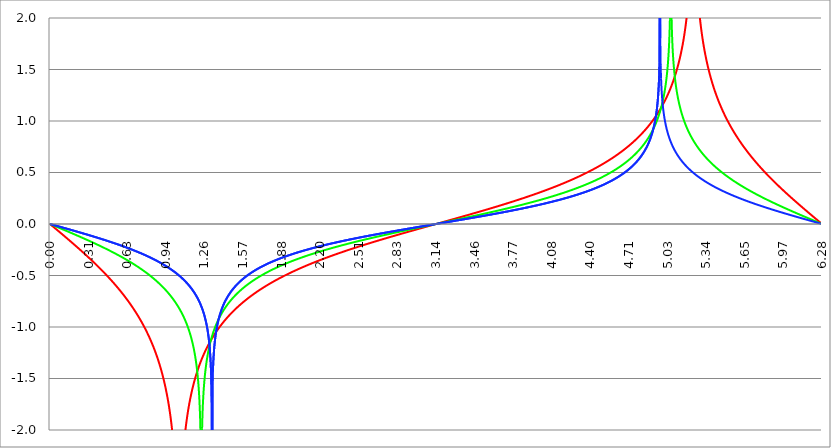
| Category | Series 1 | Series 0 | Series 2 |
|---|---|---|---|
| 0.0 | 0 | 0 | 0 |
| 0.00314159265358979 | -0.003 | -0.002 | -0.001 |
| 0.00628318530717958 | -0.006 | -0.003 | -0.002 |
| 0.00942477796076938 | -0.009 | -0.005 | -0.003 |
| 0.0125663706143592 | -0.013 | -0.006 | -0.004 |
| 0.015707963267949 | -0.016 | -0.008 | -0.005 |
| 0.0188495559215388 | -0.019 | -0.009 | -0.006 |
| 0.0219911485751285 | -0.022 | -0.011 | -0.007 |
| 0.0251327412287183 | -0.025 | -0.013 | -0.008 |
| 0.0282743338823081 | -0.028 | -0.014 | -0.009 |
| 0.0314159265358979 | -0.031 | -0.016 | -0.01 |
| 0.0345575191894877 | -0.035 | -0.017 | -0.012 |
| 0.0376991118430775 | -0.038 | -0.019 | -0.013 |
| 0.0408407044966673 | -0.041 | -0.02 | -0.014 |
| 0.0439822971502571 | -0.044 | -0.022 | -0.015 |
| 0.0471238898038469 | -0.047 | -0.024 | -0.016 |
| 0.0502654824574367 | -0.05 | -0.025 | -0.017 |
| 0.0534070751110265 | -0.053 | -0.027 | -0.018 |
| 0.0565486677646163 | -0.057 | -0.028 | -0.019 |
| 0.059690260418206 | -0.06 | -0.03 | -0.02 |
| 0.0628318530717958 | -0.063 | -0.031 | -0.021 |
| 0.0659734457253856 | -0.066 | -0.033 | -0.022 |
| 0.0691150383789754 | -0.069 | -0.035 | -0.023 |
| 0.0722566310325652 | -0.072 | -0.036 | -0.024 |
| 0.075398223686155 | -0.076 | -0.038 | -0.025 |
| 0.0785398163397448 | -0.079 | -0.039 | -0.026 |
| 0.0816814089933346 | -0.082 | -0.041 | -0.027 |
| 0.0848230016469244 | -0.085 | -0.042 | -0.028 |
| 0.0879645943005142 | -0.088 | -0.044 | -0.029 |
| 0.091106186954104 | -0.091 | -0.046 | -0.03 |
| 0.0942477796076937 | -0.095 | -0.047 | -0.031 |
| 0.0973893722612835 | -0.098 | -0.049 | -0.033 |
| 0.100530964914873 | -0.101 | -0.05 | -0.034 |
| 0.103672557568463 | -0.104 | -0.052 | -0.035 |
| 0.106814150222053 | -0.107 | -0.054 | -0.036 |
| 0.109955742875643 | -0.11 | -0.055 | -0.037 |
| 0.113097335529233 | -0.114 | -0.057 | -0.038 |
| 0.116238928182822 | -0.117 | -0.058 | -0.039 |
| 0.119380520836412 | -0.12 | -0.06 | -0.04 |
| 0.122522113490002 | -0.123 | -0.061 | -0.041 |
| 0.125663706143592 | -0.126 | -0.063 | -0.042 |
| 0.128805298797181 | -0.13 | -0.065 | -0.043 |
| 0.131946891450771 | -0.133 | -0.066 | -0.044 |
| 0.135088484104361 | -0.136 | -0.068 | -0.045 |
| 0.138230076757951 | -0.139 | -0.069 | -0.046 |
| 0.141371669411541 | -0.142 | -0.071 | -0.047 |
| 0.14451326206513 | -0.146 | -0.073 | -0.048 |
| 0.14765485471872 | -0.149 | -0.074 | -0.049 |
| 0.15079644737231 | -0.152 | -0.076 | -0.051 |
| 0.1539380400259 | -0.155 | -0.077 | -0.052 |
| 0.15707963267949 | -0.158 | -0.079 | -0.053 |
| 0.160221225333079 | -0.162 | -0.081 | -0.054 |
| 0.163362817986669 | -0.165 | -0.082 | -0.055 |
| 0.166504410640259 | -0.168 | -0.084 | -0.056 |
| 0.169646003293849 | -0.171 | -0.085 | -0.057 |
| 0.172787595947439 | -0.175 | -0.087 | -0.058 |
| 0.175929188601028 | -0.178 | -0.089 | -0.059 |
| 0.179070781254618 | -0.181 | -0.09 | -0.06 |
| 0.182212373908208 | -0.184 | -0.092 | -0.061 |
| 0.185353966561798 | -0.188 | -0.093 | -0.062 |
| 0.188495559215388 | -0.191 | -0.095 | -0.063 |
| 0.191637151868977 | -0.194 | -0.097 | -0.064 |
| 0.194778744522567 | -0.197 | -0.098 | -0.065 |
| 0.197920337176157 | -0.201 | -0.1 | -0.067 |
| 0.201061929829747 | -0.204 | -0.102 | -0.068 |
| 0.204203522483336 | -0.207 | -0.103 | -0.069 |
| 0.207345115136926 | -0.21 | -0.105 | -0.07 |
| 0.210486707790516 | -0.214 | -0.106 | -0.071 |
| 0.213628300444106 | -0.217 | -0.108 | -0.072 |
| 0.216769893097696 | -0.22 | -0.11 | -0.073 |
| 0.219911485751285 | -0.224 | -0.111 | -0.074 |
| 0.223053078404875 | -0.227 | -0.113 | -0.075 |
| 0.226194671058465 | -0.23 | -0.115 | -0.076 |
| 0.229336263712055 | -0.233 | -0.116 | -0.077 |
| 0.232477856365645 | -0.237 | -0.118 | -0.078 |
| 0.235619449019234 | -0.24 | -0.119 | -0.08 |
| 0.238761041672824 | -0.243 | -0.121 | -0.081 |
| 0.241902634326414 | -0.247 | -0.123 | -0.082 |
| 0.245044226980004 | -0.25 | -0.124 | -0.083 |
| 0.248185819633594 | -0.253 | -0.126 | -0.084 |
| 0.251327412287183 | -0.257 | -0.128 | -0.085 |
| 0.254469004940773 | -0.26 | -0.129 | -0.086 |
| 0.257610597594363 | -0.264 | -0.131 | -0.087 |
| 0.260752190247953 | -0.267 | -0.133 | -0.088 |
| 0.263893782901543 | -0.27 | -0.134 | -0.089 |
| 0.267035375555132 | -0.274 | -0.136 | -0.09 |
| 0.270176968208722 | -0.277 | -0.138 | -0.092 |
| 0.273318560862312 | -0.28 | -0.139 | -0.093 |
| 0.276460153515902 | -0.284 | -0.141 | -0.094 |
| 0.279601746169492 | -0.287 | -0.143 | -0.095 |
| 0.282743338823082 | -0.291 | -0.144 | -0.096 |
| 0.285884931476671 | -0.294 | -0.146 | -0.097 |
| 0.289026524130261 | -0.297 | -0.148 | -0.098 |
| 0.292168116783851 | -0.301 | -0.149 | -0.099 |
| 0.295309709437441 | -0.304 | -0.151 | -0.1 |
| 0.298451302091031 | -0.308 | -0.153 | -0.102 |
| 0.30159289474462 | -0.311 | -0.154 | -0.103 |
| 0.30473448739821 | -0.315 | -0.156 | -0.104 |
| 0.3078760800518 | -0.318 | -0.158 | -0.105 |
| 0.31101767270539 | -0.322 | -0.159 | -0.106 |
| 0.31415926535898 | -0.325 | -0.161 | -0.107 |
| 0.31730085801257 | -0.329 | -0.163 | -0.108 |
| 0.320442450666159 | -0.332 | -0.165 | -0.109 |
| 0.323584043319749 | -0.336 | -0.166 | -0.11 |
| 0.326725635973339 | -0.339 | -0.168 | -0.112 |
| 0.329867228626929 | -0.343 | -0.17 | -0.113 |
| 0.333008821280519 | -0.346 | -0.171 | -0.114 |
| 0.336150413934108 | -0.35 | -0.173 | -0.115 |
| 0.339292006587698 | -0.353 | -0.175 | -0.116 |
| 0.342433599241288 | -0.357 | -0.176 | -0.117 |
| 0.345575191894878 | -0.36 | -0.178 | -0.118 |
| 0.348716784548468 | -0.364 | -0.18 | -0.12 |
| 0.351858377202058 | -0.367 | -0.182 | -0.121 |
| 0.354999969855647 | -0.371 | -0.183 | -0.122 |
| 0.358141562509237 | -0.375 | -0.185 | -0.123 |
| 0.361283155162827 | -0.378 | -0.187 | -0.124 |
| 0.364424747816417 | -0.382 | -0.189 | -0.125 |
| 0.367566340470007 | -0.385 | -0.19 | -0.126 |
| 0.370707933123597 | -0.389 | -0.192 | -0.128 |
| 0.373849525777186 | -0.393 | -0.194 | -0.129 |
| 0.376991118430776 | -0.396 | -0.196 | -0.13 |
| 0.380132711084366 | -0.4 | -0.197 | -0.131 |
| 0.383274303737956 | -0.404 | -0.199 | -0.132 |
| 0.386415896391546 | -0.407 | -0.201 | -0.133 |
| 0.389557489045135 | -0.411 | -0.203 | -0.134 |
| 0.392699081698725 | -0.415 | -0.204 | -0.136 |
| 0.395840674352315 | -0.419 | -0.206 | -0.137 |
| 0.398982267005905 | -0.422 | -0.208 | -0.138 |
| 0.402123859659495 | -0.426 | -0.21 | -0.139 |
| 0.405265452313085 | -0.43 | -0.212 | -0.14 |
| 0.408407044966674 | -0.433 | -0.213 | -0.141 |
| 0.411548637620264 | -0.437 | -0.215 | -0.143 |
| 0.414690230273854 | -0.441 | -0.217 | -0.144 |
| 0.417831822927444 | -0.445 | -0.219 | -0.145 |
| 0.420973415581034 | -0.449 | -0.221 | -0.146 |
| 0.424115008234623 | -0.452 | -0.222 | -0.147 |
| 0.427256600888213 | -0.456 | -0.224 | -0.149 |
| 0.430398193541803 | -0.46 | -0.226 | -0.15 |
| 0.433539786195393 | -0.464 | -0.228 | -0.151 |
| 0.436681378848983 | -0.468 | -0.23 | -0.152 |
| 0.439822971502573 | -0.472 | -0.231 | -0.153 |
| 0.442964564156162 | -0.476 | -0.233 | -0.155 |
| 0.446106156809752 | -0.479 | -0.235 | -0.156 |
| 0.449247749463342 | -0.483 | -0.237 | -0.157 |
| 0.452389342116932 | -0.487 | -0.239 | -0.158 |
| 0.455530934770522 | -0.491 | -0.241 | -0.159 |
| 0.458672527424111 | -0.495 | -0.243 | -0.161 |
| 0.461814120077701 | -0.499 | -0.244 | -0.162 |
| 0.464955712731291 | -0.503 | -0.246 | -0.163 |
| 0.468097305384881 | -0.507 | -0.248 | -0.164 |
| 0.471238898038471 | -0.511 | -0.25 | -0.165 |
| 0.474380490692061 | -0.515 | -0.252 | -0.167 |
| 0.47752208334565 | -0.519 | -0.254 | -0.168 |
| 0.48066367599924 | -0.523 | -0.256 | -0.169 |
| 0.48380526865283 | -0.527 | -0.258 | -0.17 |
| 0.48694686130642 | -0.531 | -0.259 | -0.172 |
| 0.49008845396001 | -0.535 | -0.261 | -0.173 |
| 0.493230046613599 | -0.54 | -0.263 | -0.174 |
| 0.496371639267189 | -0.544 | -0.265 | -0.175 |
| 0.499513231920779 | -0.548 | -0.267 | -0.177 |
| 0.502654824574369 | -0.552 | -0.269 | -0.178 |
| 0.505796417227959 | -0.556 | -0.271 | -0.179 |
| 0.508938009881549 | -0.56 | -0.273 | -0.18 |
| 0.512079602535138 | -0.565 | -0.275 | -0.182 |
| 0.515221195188728 | -0.569 | -0.277 | -0.183 |
| 0.518362787842318 | -0.573 | -0.279 | -0.184 |
| 0.521504380495908 | -0.577 | -0.281 | -0.185 |
| 0.524645973149498 | -0.582 | -0.283 | -0.187 |
| 0.527787565803087 | -0.586 | -0.285 | -0.188 |
| 0.530929158456677 | -0.59 | -0.287 | -0.189 |
| 0.534070751110267 | -0.595 | -0.289 | -0.191 |
| 0.537212343763857 | -0.599 | -0.291 | -0.192 |
| 0.540353936417447 | -0.603 | -0.293 | -0.193 |
| 0.543495529071037 | -0.608 | -0.295 | -0.194 |
| 0.546637121724626 | -0.612 | -0.297 | -0.196 |
| 0.549778714378216 | -0.617 | -0.299 | -0.197 |
| 0.552920307031806 | -0.621 | -0.301 | -0.198 |
| 0.556061899685396 | -0.626 | -0.303 | -0.2 |
| 0.559203492338986 | -0.63 | -0.305 | -0.201 |
| 0.562345084992576 | -0.635 | -0.307 | -0.202 |
| 0.565486677646165 | -0.639 | -0.309 | -0.204 |
| 0.568628270299755 | -0.644 | -0.311 | -0.205 |
| 0.571769862953345 | -0.648 | -0.313 | -0.206 |
| 0.574911455606935 | -0.653 | -0.315 | -0.208 |
| 0.578053048260525 | -0.658 | -0.317 | -0.209 |
| 0.581194640914114 | -0.662 | -0.319 | -0.21 |
| 0.584336233567704 | -0.667 | -0.321 | -0.212 |
| 0.587477826221294 | -0.672 | -0.323 | -0.213 |
| 0.590619418874884 | -0.676 | -0.325 | -0.214 |
| 0.593761011528474 | -0.681 | -0.327 | -0.216 |
| 0.596902604182064 | -0.686 | -0.33 | -0.217 |
| 0.600044196835653 | -0.691 | -0.332 | -0.218 |
| 0.603185789489243 | -0.696 | -0.334 | -0.22 |
| 0.606327382142833 | -0.701 | -0.336 | -0.221 |
| 0.609468974796423 | -0.705 | -0.338 | -0.223 |
| 0.612610567450013 | -0.71 | -0.34 | -0.224 |
| 0.615752160103602 | -0.715 | -0.342 | -0.225 |
| 0.618893752757192 | -0.72 | -0.345 | -0.227 |
| 0.622035345410782 | -0.725 | -0.347 | -0.228 |
| 0.625176938064372 | -0.73 | -0.349 | -0.229 |
| 0.628318530717962 | -0.735 | -0.351 | -0.231 |
| 0.631460123371551 | -0.741 | -0.353 | -0.232 |
| 0.634601716025141 | -0.746 | -0.356 | -0.234 |
| 0.637743308678731 | -0.751 | -0.358 | -0.235 |
| 0.640884901332321 | -0.756 | -0.36 | -0.237 |
| 0.644026493985911 | -0.761 | -0.362 | -0.238 |
| 0.647168086639501 | -0.766 | -0.365 | -0.239 |
| 0.65030967929309 | -0.772 | -0.367 | -0.241 |
| 0.65345127194668 | -0.777 | -0.369 | -0.242 |
| 0.65659286460027 | -0.782 | -0.371 | -0.244 |
| 0.65973445725386 | -0.788 | -0.374 | -0.245 |
| 0.66287604990745 | -0.793 | -0.376 | -0.247 |
| 0.666017642561039 | -0.799 | -0.378 | -0.248 |
| 0.669159235214629 | -0.804 | -0.381 | -0.25 |
| 0.672300827868219 | -0.81 | -0.383 | -0.251 |
| 0.675442420521809 | -0.815 | -0.385 | -0.252 |
| 0.678584013175399 | -0.821 | -0.388 | -0.254 |
| 0.681725605828989 | -0.827 | -0.39 | -0.255 |
| 0.684867198482578 | -0.832 | -0.392 | -0.257 |
| 0.688008791136168 | -0.838 | -0.395 | -0.258 |
| 0.691150383789758 | -0.844 | -0.397 | -0.26 |
| 0.694291976443348 | -0.85 | -0.399 | -0.261 |
| 0.697433569096938 | -0.856 | -0.402 | -0.263 |
| 0.700575161750528 | -0.862 | -0.404 | -0.265 |
| 0.703716754404117 | -0.867 | -0.407 | -0.266 |
| 0.706858347057707 | -0.873 | -0.409 | -0.268 |
| 0.709999939711297 | -0.88 | -0.412 | -0.269 |
| 0.713141532364887 | -0.886 | -0.414 | -0.271 |
| 0.716283125018477 | -0.892 | -0.417 | -0.272 |
| 0.719424717672066 | -0.898 | -0.419 | -0.274 |
| 0.722566310325656 | -0.904 | -0.422 | -0.275 |
| 0.725707902979246 | -0.911 | -0.424 | -0.277 |
| 0.728849495632836 | -0.917 | -0.427 | -0.278 |
| 0.731991088286426 | -0.923 | -0.429 | -0.28 |
| 0.735132680940016 | -0.93 | -0.432 | -0.282 |
| 0.738274273593605 | -0.936 | -0.434 | -0.283 |
| 0.741415866247195 | -0.943 | -0.437 | -0.285 |
| 0.744557458900785 | -0.95 | -0.44 | -0.287 |
| 0.747699051554375 | -0.956 | -0.442 | -0.288 |
| 0.750840644207965 | -0.963 | -0.445 | -0.29 |
| 0.753982236861554 | -0.97 | -0.447 | -0.291 |
| 0.757123829515144 | -0.977 | -0.45 | -0.293 |
| 0.760265422168734 | -0.984 | -0.453 | -0.295 |
| 0.763407014822324 | -0.991 | -0.455 | -0.296 |
| 0.766548607475914 | -0.998 | -0.458 | -0.298 |
| 0.769690200129504 | -1.005 | -0.461 | -0.3 |
| 0.772831792783093 | -1.012 | -0.464 | -0.301 |
| 0.775973385436683 | -1.02 | -0.466 | -0.303 |
| 0.779114978090273 | -1.027 | -0.469 | -0.305 |
| 0.782256570743863 | -1.034 | -0.472 | -0.306 |
| 0.785398163397453 | -1.042 | -0.475 | -0.308 |
| 0.788539756051042 | -1.05 | -0.477 | -0.31 |
| 0.791681348704632 | -1.057 | -0.48 | -0.312 |
| 0.794822941358222 | -1.065 | -0.483 | -0.313 |
| 0.797964534011812 | -1.073 | -0.486 | -0.315 |
| 0.801106126665402 | -1.081 | -0.489 | -0.317 |
| 0.804247719318992 | -1.089 | -0.492 | -0.319 |
| 0.807389311972581 | -1.097 | -0.495 | -0.32 |
| 0.810530904626171 | -1.105 | -0.498 | -0.322 |
| 0.813672497279761 | -1.114 | -0.501 | -0.324 |
| 0.816814089933351 | -1.122 | -0.504 | -0.326 |
| 0.819955682586941 | -1.131 | -0.507 | -0.328 |
| 0.823097275240531 | -1.139 | -0.51 | -0.329 |
| 0.82623886789412 | -1.148 | -0.513 | -0.331 |
| 0.82938046054771 | -1.157 | -0.516 | -0.333 |
| 0.8325220532013 | -1.166 | -0.519 | -0.335 |
| 0.83566364585489 | -1.175 | -0.522 | -0.337 |
| 0.83880523850848 | -1.185 | -0.525 | -0.339 |
| 0.841946831162069 | -1.194 | -0.528 | -0.341 |
| 0.845088423815659 | -1.203 | -0.531 | -0.342 |
| 0.848230016469249 | -1.213 | -0.534 | -0.344 |
| 0.851371609122839 | -1.223 | -0.538 | -0.346 |
| 0.854513201776429 | -1.233 | -0.541 | -0.348 |
| 0.857654794430019 | -1.243 | -0.544 | -0.35 |
| 0.860796387083608 | -1.253 | -0.547 | -0.352 |
| 0.863937979737198 | -1.264 | -0.551 | -0.354 |
| 0.867079572390788 | -1.274 | -0.554 | -0.356 |
| 0.870221165044378 | -1.285 | -0.557 | -0.358 |
| 0.873362757697968 | -1.296 | -0.561 | -0.36 |
| 0.876504350351557 | -1.307 | -0.564 | -0.362 |
| 0.879645943005147 | -1.319 | -0.568 | -0.364 |
| 0.882787535658737 | -1.33 | -0.571 | -0.366 |
| 0.885929128312327 | -1.342 | -0.574 | -0.368 |
| 0.889070720965917 | -1.354 | -0.578 | -0.37 |
| 0.892212313619507 | -1.366 | -0.582 | -0.372 |
| 0.895353906273096 | -1.378 | -0.585 | -0.374 |
| 0.898495498926686 | -1.391 | -0.589 | -0.376 |
| 0.901637091580276 | -1.404 | -0.592 | -0.379 |
| 0.904778684233866 | -1.417 | -0.596 | -0.381 |
| 0.907920276887456 | -1.431 | -0.6 | -0.383 |
| 0.911061869541045 | -1.444 | -0.603 | -0.385 |
| 0.914203462194635 | -1.458 | -0.607 | -0.387 |
| 0.917345054848225 | -1.473 | -0.611 | -0.389 |
| 0.920486647501815 | -1.488 | -0.615 | -0.392 |
| 0.923628240155405 | -1.503 | -0.619 | -0.394 |
| 0.926769832808995 | -1.518 | -0.623 | -0.396 |
| 0.929911425462584 | -1.534 | -0.627 | -0.398 |
| 0.933053018116174 | -1.55 | -0.63 | -0.4 |
| 0.936194610769764 | -1.567 | -0.635 | -0.403 |
| 0.939336203423354 | -1.584 | -0.639 | -0.405 |
| 0.942477796076944 | -1.602 | -0.643 | -0.407 |
| 0.945619388730533 | -1.62 | -0.647 | -0.41 |
| 0.948760981384123 | -1.639 | -0.651 | -0.412 |
| 0.951902574037713 | -1.658 | -0.655 | -0.414 |
| 0.955044166691303 | -1.678 | -0.659 | -0.417 |
| 0.958185759344893 | -1.698 | -0.664 | -0.419 |
| 0.961327351998483 | -1.72 | -0.668 | -0.422 |
| 0.964468944652072 | -1.742 | -0.673 | -0.424 |
| 0.967610537305662 | -1.765 | -0.677 | -0.427 |
| 0.970752129959252 | -1.788 | -0.681 | -0.429 |
| 0.973893722612842 | -1.813 | -0.686 | -0.432 |
| 0.977035315266432 | -1.839 | -0.691 | -0.434 |
| 0.980176907920022 | -1.866 | -0.695 | -0.437 |
| 0.983318500573611 | -1.894 | -0.7 | -0.439 |
| 0.986460093227201 | -1.924 | -0.705 | -0.442 |
| 0.989601685880791 | -1.955 | -0.71 | -0.444 |
| 0.992743278534381 | -1.988 | -0.714 | -0.447 |
| 0.995884871187971 | -2.023 | -0.719 | -0.45 |
| 0.99902646384156 | -2.06 | -0.724 | -0.452 |
| 1.00216805649515 | -2.1 | -0.73 | -0.455 |
| 1.00530964914874 | -2.142 | -0.735 | -0.458 |
| 1.00845124180233 | -2.187 | -0.74 | -0.461 |
| 1.01159283445592 | -2.237 | -0.745 | -0.463 |
| 1.01473442710951 | -2.291 | -0.75 | -0.466 |
| 1.017876019763099 | -2.35 | -0.756 | -0.469 |
| 1.021017612416689 | -2.416 | -0.761 | -0.472 |
| 1.02415920507028 | -2.49 | -0.767 | -0.475 |
| 1.027300797723869 | -2.575 | -0.773 | -0.478 |
| 1.030442390377459 | -2.675 | -0.778 | -0.481 |
| 1.033583983031048 | -2.796 | -0.784 | -0.484 |
| 1.036725575684638 | -2.948 | -0.79 | -0.487 |
| 1.039867168338228 | -3.154 | -0.796 | -0.49 |
| 1.043008760991818 | -3.478 | -0.802 | -0.493 |
| 1.046150353645408 | -4.279 | -0.808 | -0.496 |
| 1.049291946298998 | -3.879 | -0.815 | -0.499 |
| 1.052433538952587 | -3.35 | -0.821 | -0.502 |
| 1.055575131606177 | -3.08 | -0.828 | -0.505 |
| 1.058716724259767 | -2.896 | -0.834 | -0.509 |
| 1.061858316913357 | -2.757 | -0.841 | -0.512 |
| 1.064999909566947 | -2.646 | -0.848 | -0.515 |
| 1.068141502220536 | -2.553 | -0.855 | -0.519 |
| 1.071283094874126 | -2.472 | -0.862 | -0.522 |
| 1.074424687527716 | -2.402 | -0.869 | -0.526 |
| 1.077566280181306 | -2.34 | -0.877 | -0.529 |
| 1.080707872834896 | -2.283 | -0.884 | -0.533 |
| 1.083849465488486 | -2.232 | -0.892 | -0.536 |
| 1.086991058142075 | -2.185 | -0.9 | -0.54 |
| 1.090132650795665 | -2.142 | -0.908 | -0.544 |
| 1.093274243449255 | -2.101 | -0.916 | -0.547 |
| 1.096415836102845 | -2.064 | -0.924 | -0.551 |
| 1.099557428756435 | -2.029 | -0.933 | -0.555 |
| 1.102699021410025 | -1.995 | -0.942 | -0.559 |
| 1.105840614063614 | -1.964 | -0.951 | -0.563 |
| 1.108982206717204 | -1.935 | -0.96 | -0.567 |
| 1.112123799370794 | -1.906 | -0.969 | -0.571 |
| 1.115265392024384 | -1.88 | -0.979 | -0.575 |
| 1.118406984677974 | -1.854 | -0.989 | -0.579 |
| 1.121548577331563 | -1.83 | -0.999 | -0.583 |
| 1.124690169985153 | -1.806 | -1.01 | -0.587 |
| 1.127831762638743 | -1.784 | -1.021 | -0.592 |
| 1.130973355292333 | -1.762 | -1.032 | -0.596 |
| 1.134114947945923 | -1.741 | -1.043 | -0.601 |
| 1.137256540599513 | -1.721 | -1.055 | -0.605 |
| 1.140398133253102 | -1.702 | -1.067 | -0.61 |
| 1.143539725906692 | -1.683 | -1.08 | -0.615 |
| 1.146681318560282 | -1.665 | -1.093 | -0.62 |
| 1.149822911213872 | -1.648 | -1.107 | -0.624 |
| 1.152964503867462 | -1.631 | -1.121 | -0.629 |
| 1.156106096521051 | -1.615 | -1.136 | -0.635 |
| 1.159247689174641 | -1.599 | -1.151 | -0.64 |
| 1.162389281828231 | -1.583 | -1.167 | -0.645 |
| 1.165530874481821 | -1.568 | -1.184 | -0.65 |
| 1.168672467135411 | -1.553 | -1.202 | -0.656 |
| 1.171814059789001 | -1.539 | -1.22 | -0.662 |
| 1.17495565244259 | -1.525 | -1.24 | -0.667 |
| 1.17809724509618 | -1.512 | -1.26 | -0.673 |
| 1.18123883774977 | -1.498 | -1.282 | -0.679 |
| 1.18438043040336 | -1.486 | -1.305 | -0.685 |
| 1.18752202305695 | -1.473 | -1.33 | -0.691 |
| 1.190663615710539 | -1.461 | -1.357 | -0.698 |
| 1.193805208364129 | -1.449 | -1.386 | -0.704 |
| 1.19694680101772 | -1.437 | -1.417 | -0.711 |
| 1.200088393671309 | -1.425 | -1.452 | -0.718 |
| 1.203229986324899 | -1.414 | -1.49 | -0.725 |
| 1.206371578978489 | -1.403 | -1.533 | -0.732 |
| 1.209513171632078 | -1.392 | -1.581 | -0.74 |
| 1.212654764285668 | -1.381 | -1.638 | -0.748 |
| 1.215796356939258 | -1.371 | -1.704 | -0.756 |
| 1.218937949592848 | -1.361 | -1.787 | -0.764 |
| 1.222079542246438 | -1.351 | -1.894 | -0.772 |
| 1.225221134900027 | -1.341 | -2.048 | -0.781 |
| 1.228362727553617 | -1.331 | -2.329 | -0.79 |
| 1.231504320207207 | -1.322 | -2.881 | -0.799 |
| 1.234645912860797 | -1.313 | -2.205 | -0.809 |
| 1.237787505514387 | -1.303 | -1.988 | -0.819 |
| 1.240929098167977 | -1.294 | -1.854 | -0.829 |
| 1.244070690821566 | -1.286 | -1.757 | -0.84 |
| 1.247212283475156 | -1.277 | -1.682 | -0.851 |
| 1.250353876128746 | -1.268 | -1.619 | -0.863 |
| 1.253495468782336 | -1.26 | -1.567 | -0.876 |
| 1.256637061435926 | -1.252 | -1.521 | -0.889 |
| 1.259778654089515 | -1.243 | -1.48 | -0.902 |
| 1.262920246743105 | -1.235 | -1.444 | -0.917 |
| 1.266061839396695 | -1.228 | -1.411 | -0.932 |
| 1.269203432050285 | -1.22 | -1.38 | -0.948 |
| 1.272345024703875 | -1.212 | -1.353 | -0.965 |
| 1.275486617357465 | -1.204 | -1.327 | -0.984 |
| 1.278628210011054 | -1.197 | -1.303 | -1.004 |
| 1.281769802664644 | -1.19 | -1.281 | -1.025 |
| 1.284911395318234 | -1.182 | -1.26 | -1.049 |
| 1.288052987971824 | -1.175 | -1.24 | -1.074 |
| 1.291194580625414 | -1.168 | -1.221 | -1.103 |
| 1.294336173279003 | -1.161 | -1.203 | -1.135 |
| 1.297477765932593 | -1.154 | -1.186 | -1.172 |
| 1.300619358586183 | -1.148 | -1.17 | -1.215 |
| 1.303760951239773 | -1.141 | -1.155 | -1.266 |
| 1.306902543893363 | -1.134 | -1.14 | -1.33 |
| 1.310044136546953 | -1.128 | -1.126 | -1.415 |
| 1.313185729200542 | -1.121 | -1.112 | -1.542 |
| 1.316327321854132 | -1.115 | -1.099 | -1.804 |
| 1.319468914507722 | -1.109 | -1.087 | -3 |
| 1.322610507161312 | -1.102 | -1.075 | -1.566 |
| 1.325752099814902 | -1.096 | -1.063 | -1.43 |
| 1.328893692468491 | -1.09 | -1.052 | -1.341 |
| 1.332035285122081 | -1.084 | -1.041 | -1.275 |
| 1.335176877775671 | -1.078 | -1.03 | -1.222 |
| 1.338318470429261 | -1.072 | -1.02 | -1.179 |
| 1.341460063082851 | -1.067 | -1.01 | -1.142 |
| 1.344601655736441 | -1.061 | -1 | -1.109 |
| 1.34774324839003 | -1.055 | -0.99 | -1.08 |
| 1.35088484104362 | -1.05 | -0.981 | -1.054 |
| 1.35402643369721 | -1.044 | -0.972 | -1.031 |
| 1.3571680263508 | -1.039 | -0.963 | -1.009 |
| 1.36030961900439 | -1.033 | -0.955 | -0.989 |
| 1.363451211657979 | -1.028 | -0.947 | -0.971 |
| 1.36659280431157 | -1.022 | -0.938 | -0.954 |
| 1.369734396965159 | -1.017 | -0.93 | -0.938 |
| 1.372875989618749 | -1.012 | -0.923 | -0.922 |
| 1.376017582272339 | -1.007 | -0.915 | -0.908 |
| 1.379159174925929 | -1.002 | -0.908 | -0.895 |
| 1.382300767579518 | -0.997 | -0.901 | -0.882 |
| 1.385442360233108 | -0.992 | -0.893 | -0.869 |
| 1.388583952886698 | -0.987 | -0.886 | -0.858 |
| 1.391725545540288 | -0.982 | -0.88 | -0.847 |
| 1.394867138193878 | -0.977 | -0.873 | -0.836 |
| 1.398008730847468 | -0.972 | -0.866 | -0.826 |
| 1.401150323501057 | -0.967 | -0.86 | -0.816 |
| 1.404291916154647 | -0.963 | -0.854 | -0.806 |
| 1.407433508808237 | -0.958 | -0.847 | -0.797 |
| 1.410575101461827 | -0.953 | -0.841 | -0.788 |
| 1.413716694115417 | -0.949 | -0.835 | -0.78 |
| 1.416858286769006 | -0.944 | -0.83 | -0.771 |
| 1.419999879422596 | -0.94 | -0.824 | -0.763 |
| 1.423141472076186 | -0.935 | -0.818 | -0.756 |
| 1.426283064729776 | -0.931 | -0.813 | -0.748 |
| 1.429424657383366 | -0.926 | -0.807 | -0.741 |
| 1.432566250036956 | -0.922 | -0.802 | -0.734 |
| 1.435707842690545 | -0.918 | -0.796 | -0.727 |
| 1.438849435344135 | -0.913 | -0.791 | -0.72 |
| 1.441991027997725 | -0.909 | -0.786 | -0.714 |
| 1.445132620651315 | -0.905 | -0.781 | -0.707 |
| 1.448274213304905 | -0.901 | -0.776 | -0.701 |
| 1.451415805958494 | -0.897 | -0.771 | -0.695 |
| 1.454557398612084 | -0.893 | -0.766 | -0.689 |
| 1.457698991265674 | -0.889 | -0.761 | -0.683 |
| 1.460840583919264 | -0.885 | -0.757 | -0.678 |
| 1.463982176572854 | -0.88 | -0.752 | -0.672 |
| 1.467123769226444 | -0.877 | -0.747 | -0.667 |
| 1.470265361880033 | -0.873 | -0.743 | -0.661 |
| 1.473406954533623 | -0.869 | -0.738 | -0.656 |
| 1.476548547187213 | -0.865 | -0.734 | -0.651 |
| 1.479690139840803 | -0.861 | -0.73 | -0.646 |
| 1.482831732494393 | -0.857 | -0.725 | -0.641 |
| 1.485973325147982 | -0.853 | -0.721 | -0.636 |
| 1.489114917801572 | -0.85 | -0.717 | -0.632 |
| 1.492256510455162 | -0.846 | -0.713 | -0.627 |
| 1.495398103108752 | -0.842 | -0.709 | -0.623 |
| 1.498539695762342 | -0.838 | -0.705 | -0.618 |
| 1.501681288415932 | -0.835 | -0.701 | -0.614 |
| 1.504822881069521 | -0.831 | -0.697 | -0.609 |
| 1.507964473723111 | -0.827 | -0.693 | -0.605 |
| 1.511106066376701 | -0.824 | -0.689 | -0.601 |
| 1.514247659030291 | -0.82 | -0.685 | -0.597 |
| 1.517389251683881 | -0.817 | -0.681 | -0.593 |
| 1.520530844337471 | -0.813 | -0.678 | -0.589 |
| 1.52367243699106 | -0.81 | -0.674 | -0.585 |
| 1.52681402964465 | -0.806 | -0.67 | -0.581 |
| 1.52995562229824 | -0.803 | -0.667 | -0.577 |
| 1.53309721495183 | -0.8 | -0.663 | -0.574 |
| 1.53623880760542 | -0.796 | -0.66 | -0.57 |
| 1.539380400259009 | -0.793 | -0.656 | -0.566 |
| 1.542521992912599 | -0.789 | -0.653 | -0.563 |
| 1.545663585566189 | -0.786 | -0.649 | -0.559 |
| 1.548805178219779 | -0.783 | -0.646 | -0.556 |
| 1.551946770873369 | -0.78 | -0.643 | -0.552 |
| 1.555088363526959 | -0.776 | -0.639 | -0.549 |
| 1.558229956180548 | -0.773 | -0.636 | -0.546 |
| 1.561371548834138 | -0.77 | -0.633 | -0.542 |
| 1.564513141487728 | -0.767 | -0.63 | -0.539 |
| 1.567654734141318 | -0.763 | -0.626 | -0.536 |
| 1.570796326794908 | -0.76 | -0.623 | -0.533 |
| 1.573937919448497 | -0.757 | -0.62 | -0.53 |
| 1.577079512102087 | -0.754 | -0.617 | -0.527 |
| 1.580221104755677 | -0.751 | -0.614 | -0.524 |
| 1.583362697409267 | -0.748 | -0.611 | -0.521 |
| 1.586504290062857 | -0.745 | -0.608 | -0.518 |
| 1.589645882716447 | -0.742 | -0.605 | -0.515 |
| 1.592787475370036 | -0.739 | -0.602 | -0.512 |
| 1.595929068023626 | -0.736 | -0.599 | -0.509 |
| 1.599070660677216 | -0.733 | -0.596 | -0.506 |
| 1.602212253330806 | -0.73 | -0.593 | -0.503 |
| 1.605353845984396 | -0.727 | -0.59 | -0.5 |
| 1.608495438637985 | -0.724 | -0.588 | -0.498 |
| 1.611637031291575 | -0.721 | -0.585 | -0.495 |
| 1.614778623945165 | -0.718 | -0.582 | -0.492 |
| 1.617920216598755 | -0.715 | -0.579 | -0.49 |
| 1.621061809252345 | -0.712 | -0.576 | -0.487 |
| 1.624203401905935 | -0.71 | -0.574 | -0.484 |
| 1.627344994559524 | -0.707 | -0.571 | -0.482 |
| 1.630486587213114 | -0.704 | -0.568 | -0.479 |
| 1.633628179866704 | -0.701 | -0.566 | -0.477 |
| 1.636769772520294 | -0.698 | -0.563 | -0.474 |
| 1.639911365173884 | -0.696 | -0.56 | -0.472 |
| 1.643052957827473 | -0.693 | -0.558 | -0.469 |
| 1.646194550481063 | -0.69 | -0.555 | -0.467 |
| 1.649336143134653 | -0.687 | -0.553 | -0.464 |
| 1.652477735788243 | -0.685 | -0.55 | -0.462 |
| 1.655619328441833 | -0.682 | -0.548 | -0.46 |
| 1.658760921095423 | -0.679 | -0.545 | -0.457 |
| 1.661902513749012 | -0.677 | -0.543 | -0.455 |
| 1.665044106402602 | -0.674 | -0.54 | -0.453 |
| 1.668185699056192 | -0.671 | -0.538 | -0.451 |
| 1.671327291709782 | -0.669 | -0.535 | -0.448 |
| 1.674468884363372 | -0.666 | -0.533 | -0.446 |
| 1.677610477016961 | -0.664 | -0.531 | -0.444 |
| 1.680752069670551 | -0.661 | -0.528 | -0.442 |
| 1.683893662324141 | -0.658 | -0.526 | -0.439 |
| 1.687035254977731 | -0.656 | -0.523 | -0.437 |
| 1.690176847631321 | -0.653 | -0.521 | -0.435 |
| 1.693318440284911 | -0.651 | -0.519 | -0.433 |
| 1.6964600329385 | -0.648 | -0.517 | -0.431 |
| 1.69960162559209 | -0.646 | -0.514 | -0.429 |
| 1.70274321824568 | -0.643 | -0.512 | -0.427 |
| 1.70588481089927 | -0.641 | -0.51 | -0.425 |
| 1.70902640355286 | -0.638 | -0.508 | -0.423 |
| 1.712167996206449 | -0.636 | -0.505 | -0.421 |
| 1.715309588860039 | -0.633 | -0.503 | -0.419 |
| 1.71845118151363 | -0.631 | -0.501 | -0.417 |
| 1.721592774167219 | -0.629 | -0.499 | -0.415 |
| 1.724734366820809 | -0.626 | -0.497 | -0.413 |
| 1.727875959474399 | -0.624 | -0.494 | -0.411 |
| 1.731017552127988 | -0.621 | -0.492 | -0.409 |
| 1.734159144781578 | -0.619 | -0.49 | -0.407 |
| 1.737300737435168 | -0.617 | -0.488 | -0.405 |
| 1.740442330088758 | -0.614 | -0.486 | -0.403 |
| 1.743583922742348 | -0.612 | -0.484 | -0.401 |
| 1.746725515395937 | -0.61 | -0.482 | -0.4 |
| 1.749867108049527 | -0.607 | -0.48 | -0.398 |
| 1.753008700703117 | -0.605 | -0.478 | -0.396 |
| 1.756150293356707 | -0.603 | -0.476 | -0.394 |
| 1.759291886010297 | -0.6 | -0.474 | -0.392 |
| 1.762433478663887 | -0.598 | -0.472 | -0.39 |
| 1.765575071317476 | -0.596 | -0.47 | -0.389 |
| 1.768716663971066 | -0.594 | -0.468 | -0.387 |
| 1.771858256624656 | -0.591 | -0.466 | -0.385 |
| 1.774999849278246 | -0.589 | -0.464 | -0.383 |
| 1.778141441931836 | -0.587 | -0.462 | -0.382 |
| 1.781283034585426 | -0.585 | -0.46 | -0.38 |
| 1.784424627239015 | -0.582 | -0.458 | -0.378 |
| 1.787566219892605 | -0.58 | -0.456 | -0.377 |
| 1.790707812546195 | -0.578 | -0.454 | -0.375 |
| 1.793849405199785 | -0.576 | -0.452 | -0.373 |
| 1.796990997853375 | -0.574 | -0.45 | -0.372 |
| 1.800132590506964 | -0.571 | -0.449 | -0.37 |
| 1.803274183160554 | -0.569 | -0.447 | -0.368 |
| 1.806415775814144 | -0.567 | -0.445 | -0.367 |
| 1.809557368467734 | -0.565 | -0.443 | -0.365 |
| 1.812698961121324 | -0.563 | -0.441 | -0.363 |
| 1.815840553774914 | -0.561 | -0.439 | -0.362 |
| 1.818982146428503 | -0.559 | -0.438 | -0.36 |
| 1.822123739082093 | -0.557 | -0.436 | -0.359 |
| 1.825265331735683 | -0.554 | -0.434 | -0.357 |
| 1.828406924389273 | -0.552 | -0.432 | -0.355 |
| 1.831548517042863 | -0.55 | -0.43 | -0.354 |
| 1.834690109696452 | -0.548 | -0.429 | -0.352 |
| 1.837831702350042 | -0.546 | -0.427 | -0.351 |
| 1.840973295003632 | -0.544 | -0.425 | -0.349 |
| 1.844114887657222 | -0.542 | -0.423 | -0.348 |
| 1.847256480310812 | -0.54 | -0.422 | -0.346 |
| 1.850398072964402 | -0.538 | -0.42 | -0.345 |
| 1.853539665617991 | -0.536 | -0.418 | -0.343 |
| 1.856681258271581 | -0.534 | -0.416 | -0.342 |
| 1.859822850925171 | -0.532 | -0.415 | -0.34 |
| 1.862964443578761 | -0.53 | -0.413 | -0.339 |
| 1.866106036232351 | -0.528 | -0.411 | -0.337 |
| 1.86924762888594 | -0.526 | -0.41 | -0.336 |
| 1.87238922153953 | -0.524 | -0.408 | -0.335 |
| 1.87553081419312 | -0.522 | -0.406 | -0.333 |
| 1.87867240684671 | -0.52 | -0.405 | -0.332 |
| 1.8818139995003 | -0.518 | -0.403 | -0.33 |
| 1.88495559215389 | -0.516 | -0.401 | -0.329 |
| 1.888097184807479 | -0.514 | -0.4 | -0.327 |
| 1.891238777461069 | -0.512 | -0.398 | -0.326 |
| 1.89438037011466 | -0.51 | -0.397 | -0.325 |
| 1.897521962768249 | -0.508 | -0.395 | -0.323 |
| 1.900663555421839 | -0.507 | -0.393 | -0.322 |
| 1.903805148075429 | -0.505 | -0.392 | -0.321 |
| 1.906946740729018 | -0.503 | -0.39 | -0.319 |
| 1.910088333382608 | -0.501 | -0.389 | -0.318 |
| 1.913229926036198 | -0.499 | -0.387 | -0.317 |
| 1.916371518689788 | -0.497 | -0.386 | -0.315 |
| 1.919513111343378 | -0.495 | -0.384 | -0.314 |
| 1.922654703996967 | -0.493 | -0.382 | -0.313 |
| 1.925796296650557 | -0.492 | -0.381 | -0.311 |
| 1.928937889304147 | -0.49 | -0.379 | -0.31 |
| 1.932079481957737 | -0.488 | -0.378 | -0.309 |
| 1.935221074611327 | -0.486 | -0.376 | -0.307 |
| 1.938362667264917 | -0.484 | -0.375 | -0.306 |
| 1.941504259918506 | -0.482 | -0.373 | -0.305 |
| 1.944645852572096 | -0.481 | -0.372 | -0.303 |
| 1.947787445225686 | -0.479 | -0.37 | -0.302 |
| 1.950929037879276 | -0.477 | -0.369 | -0.301 |
| 1.954070630532866 | -0.475 | -0.367 | -0.3 |
| 1.957212223186455 | -0.473 | -0.366 | -0.298 |
| 1.960353815840045 | -0.472 | -0.364 | -0.297 |
| 1.963495408493635 | -0.47 | -0.363 | -0.296 |
| 1.966637001147225 | -0.468 | -0.361 | -0.295 |
| 1.969778593800815 | -0.466 | -0.36 | -0.293 |
| 1.972920186454405 | -0.464 | -0.359 | -0.292 |
| 1.976061779107994 | -0.463 | -0.357 | -0.291 |
| 1.979203371761584 | -0.461 | -0.356 | -0.29 |
| 1.982344964415174 | -0.459 | -0.354 | -0.289 |
| 1.985486557068764 | -0.457 | -0.353 | -0.287 |
| 1.988628149722354 | -0.456 | -0.351 | -0.286 |
| 1.991769742375943 | -0.454 | -0.35 | -0.285 |
| 1.994911335029533 | -0.452 | -0.349 | -0.284 |
| 1.998052927683123 | -0.451 | -0.347 | -0.283 |
| 2.001194520336712 | -0.449 | -0.346 | -0.281 |
| 2.004336112990302 | -0.447 | -0.344 | -0.28 |
| 2.007477705643892 | -0.445 | -0.343 | -0.279 |
| 2.010619298297482 | -0.444 | -0.342 | -0.278 |
| 2.013760890951071 | -0.442 | -0.34 | -0.277 |
| 2.016902483604661 | -0.44 | -0.339 | -0.276 |
| 2.02004407625825 | -0.439 | -0.338 | -0.274 |
| 2.02318566891184 | -0.437 | -0.336 | -0.273 |
| 2.02632726156543 | -0.435 | -0.335 | -0.272 |
| 2.029468854219019 | -0.434 | -0.333 | -0.271 |
| 2.032610446872609 | -0.432 | -0.332 | -0.27 |
| 2.035752039526198 | -0.43 | -0.331 | -0.269 |
| 2.038893632179788 | -0.429 | -0.329 | -0.268 |
| 2.042035224833378 | -0.427 | -0.328 | -0.267 |
| 2.045176817486967 | -0.425 | -0.327 | -0.265 |
| 2.048318410140557 | -0.424 | -0.325 | -0.264 |
| 2.051460002794146 | -0.422 | -0.324 | -0.263 |
| 2.054601595447736 | -0.42 | -0.323 | -0.262 |
| 2.057743188101325 | -0.419 | -0.321 | -0.261 |
| 2.060884780754915 | -0.417 | -0.32 | -0.26 |
| 2.064026373408505 | -0.416 | -0.319 | -0.259 |
| 2.067167966062094 | -0.414 | -0.318 | -0.258 |
| 2.070309558715684 | -0.412 | -0.316 | -0.257 |
| 2.073451151369273 | -0.411 | -0.315 | -0.256 |
| 2.076592744022863 | -0.409 | -0.314 | -0.254 |
| 2.079734336676452 | -0.408 | -0.312 | -0.253 |
| 2.082875929330042 | -0.406 | -0.311 | -0.252 |
| 2.086017521983632 | -0.404 | -0.31 | -0.251 |
| 2.089159114637221 | -0.403 | -0.309 | -0.25 |
| 2.092300707290811 | -0.401 | -0.307 | -0.249 |
| 2.095442299944401 | -0.4 | -0.306 | -0.248 |
| 2.09858389259799 | -0.398 | -0.305 | -0.247 |
| 2.10172548525158 | -0.397 | -0.304 | -0.246 |
| 2.104867077905169 | -0.395 | -0.302 | -0.245 |
| 2.108008670558759 | -0.393 | -0.301 | -0.244 |
| 2.111150263212349 | -0.392 | -0.3 | -0.243 |
| 2.114291855865938 | -0.39 | -0.299 | -0.242 |
| 2.117433448519528 | -0.389 | -0.297 | -0.241 |
| 2.120575041173117 | -0.387 | -0.296 | -0.24 |
| 2.123716633826707 | -0.386 | -0.295 | -0.239 |
| 2.126858226480297 | -0.384 | -0.294 | -0.238 |
| 2.129999819133886 | -0.383 | -0.293 | -0.237 |
| 2.133141411787476 | -0.381 | -0.291 | -0.236 |
| 2.136283004441065 | -0.38 | -0.29 | -0.235 |
| 2.139424597094655 | -0.378 | -0.289 | -0.234 |
| 2.142566189748245 | -0.377 | -0.288 | -0.233 |
| 2.145707782401834 | -0.375 | -0.287 | -0.232 |
| 2.148849375055424 | -0.374 | -0.285 | -0.231 |
| 2.151990967709013 | -0.372 | -0.284 | -0.23 |
| 2.155132560362603 | -0.371 | -0.283 | -0.229 |
| 2.158274153016193 | -0.369 | -0.282 | -0.228 |
| 2.161415745669782 | -0.368 | -0.281 | -0.227 |
| 2.164557338323372 | -0.366 | -0.279 | -0.226 |
| 2.167698930976961 | -0.365 | -0.278 | -0.225 |
| 2.170840523630551 | -0.363 | -0.277 | -0.224 |
| 2.173982116284141 | -0.362 | -0.276 | -0.223 |
| 2.17712370893773 | -0.36 | -0.275 | -0.222 |
| 2.18026530159132 | -0.359 | -0.274 | -0.221 |
| 2.183406894244909 | -0.357 | -0.272 | -0.22 |
| 2.186548486898499 | -0.356 | -0.271 | -0.219 |
| 2.189690079552089 | -0.354 | -0.27 | -0.218 |
| 2.192831672205678 | -0.353 | -0.269 | -0.217 |
| 2.195973264859268 | -0.351 | -0.268 | -0.216 |
| 2.199114857512857 | -0.35 | -0.267 | -0.216 |
| 2.202256450166447 | -0.349 | -0.266 | -0.215 |
| 2.205398042820036 | -0.347 | -0.264 | -0.214 |
| 2.208539635473626 | -0.346 | -0.263 | -0.213 |
| 2.211681228127216 | -0.344 | -0.262 | -0.212 |
| 2.214822820780805 | -0.343 | -0.261 | -0.211 |
| 2.217964413434395 | -0.341 | -0.26 | -0.21 |
| 2.221106006087984 | -0.34 | -0.259 | -0.209 |
| 2.224247598741574 | -0.339 | -0.258 | -0.208 |
| 2.227389191395164 | -0.337 | -0.257 | -0.207 |
| 2.230530784048753 | -0.336 | -0.256 | -0.206 |
| 2.233672376702343 | -0.334 | -0.254 | -0.205 |
| 2.236813969355933 | -0.333 | -0.253 | -0.204 |
| 2.239955562009522 | -0.332 | -0.252 | -0.204 |
| 2.243097154663112 | -0.33 | -0.251 | -0.203 |
| 2.246238747316701 | -0.329 | -0.25 | -0.202 |
| 2.249380339970291 | -0.327 | -0.249 | -0.201 |
| 2.252521932623881 | -0.326 | -0.248 | -0.2 |
| 2.25566352527747 | -0.325 | -0.247 | -0.199 |
| 2.25880511793106 | -0.323 | -0.246 | -0.198 |
| 2.261946710584649 | -0.322 | -0.245 | -0.197 |
| 2.265088303238239 | -0.32 | -0.244 | -0.196 |
| 2.268229895891829 | -0.319 | -0.242 | -0.196 |
| 2.271371488545418 | -0.318 | -0.241 | -0.195 |
| 2.274513081199008 | -0.316 | -0.24 | -0.194 |
| 2.277654673852597 | -0.315 | -0.239 | -0.193 |
| 2.280796266506186 | -0.314 | -0.238 | -0.192 |
| 2.283937859159776 | -0.312 | -0.237 | -0.191 |
| 2.287079451813366 | -0.311 | -0.236 | -0.19 |
| 2.290221044466955 | -0.309 | -0.235 | -0.189 |
| 2.293362637120545 | -0.308 | -0.234 | -0.189 |
| 2.296504229774135 | -0.307 | -0.233 | -0.188 |
| 2.299645822427724 | -0.305 | -0.232 | -0.187 |
| 2.302787415081314 | -0.304 | -0.231 | -0.186 |
| 2.305929007734904 | -0.303 | -0.23 | -0.185 |
| 2.309070600388493 | -0.301 | -0.229 | -0.184 |
| 2.312212193042083 | -0.3 | -0.228 | -0.183 |
| 2.315353785695672 | -0.299 | -0.227 | -0.183 |
| 2.318495378349262 | -0.297 | -0.226 | -0.182 |
| 2.321636971002852 | -0.296 | -0.225 | -0.181 |
| 2.324778563656441 | -0.295 | -0.224 | -0.18 |
| 2.327920156310031 | -0.293 | -0.223 | -0.179 |
| 2.33106174896362 | -0.292 | -0.221 | -0.178 |
| 2.33420334161721 | -0.291 | -0.22 | -0.178 |
| 2.3373449342708 | -0.289 | -0.219 | -0.177 |
| 2.340486526924389 | -0.288 | -0.218 | -0.176 |
| 2.343628119577979 | -0.287 | -0.217 | -0.175 |
| 2.346769712231568 | -0.286 | -0.216 | -0.174 |
| 2.349911304885158 | -0.284 | -0.215 | -0.173 |
| 2.353052897538748 | -0.283 | -0.214 | -0.173 |
| 2.356194490192337 | -0.282 | -0.213 | -0.172 |
| 2.359336082845927 | -0.28 | -0.212 | -0.171 |
| 2.362477675499516 | -0.279 | -0.211 | -0.17 |
| 2.365619268153106 | -0.278 | -0.21 | -0.169 |
| 2.368760860806696 | -0.276 | -0.209 | -0.168 |
| 2.371902453460285 | -0.275 | -0.208 | -0.168 |
| 2.375044046113875 | -0.274 | -0.207 | -0.167 |
| 2.378185638767464 | -0.273 | -0.206 | -0.166 |
| 2.381327231421054 | -0.271 | -0.205 | -0.165 |
| 2.384468824074644 | -0.27 | -0.204 | -0.164 |
| 2.387610416728233 | -0.269 | -0.203 | -0.164 |
| 2.390752009381823 | -0.267 | -0.202 | -0.163 |
| 2.393893602035412 | -0.266 | -0.201 | -0.162 |
| 2.397035194689002 | -0.265 | -0.2 | -0.161 |
| 2.400176787342591 | -0.264 | -0.199 | -0.16 |
| 2.403318379996181 | -0.262 | -0.198 | -0.16 |
| 2.406459972649771 | -0.261 | -0.198 | -0.159 |
| 2.40960156530336 | -0.26 | -0.197 | -0.158 |
| 2.41274315795695 | -0.259 | -0.196 | -0.157 |
| 2.41588475061054 | -0.257 | -0.195 | -0.156 |
| 2.419026343264129 | -0.256 | -0.194 | -0.156 |
| 2.422167935917719 | -0.255 | -0.193 | -0.155 |
| 2.425309528571308 | -0.254 | -0.192 | -0.154 |
| 2.428451121224898 | -0.252 | -0.191 | -0.153 |
| 2.431592713878488 | -0.251 | -0.19 | -0.153 |
| 2.434734306532077 | -0.25 | -0.189 | -0.152 |
| 2.437875899185667 | -0.249 | -0.188 | -0.151 |
| 2.441017491839256 | -0.247 | -0.187 | -0.15 |
| 2.444159084492846 | -0.246 | -0.186 | -0.149 |
| 2.447300677146435 | -0.245 | -0.185 | -0.149 |
| 2.450442269800025 | -0.244 | -0.184 | -0.148 |
| 2.453583862453615 | -0.242 | -0.183 | -0.147 |
| 2.456725455107204 | -0.241 | -0.182 | -0.146 |
| 2.459867047760794 | -0.24 | -0.181 | -0.146 |
| 2.463008640414384 | -0.239 | -0.18 | -0.145 |
| 2.466150233067973 | -0.237 | -0.179 | -0.144 |
| 2.469291825721563 | -0.236 | -0.178 | -0.143 |
| 2.472433418375152 | -0.235 | -0.177 | -0.143 |
| 2.475575011028742 | -0.234 | -0.177 | -0.142 |
| 2.478716603682332 | -0.233 | -0.176 | -0.141 |
| 2.481858196335921 | -0.231 | -0.175 | -0.14 |
| 2.48499978898951 | -0.23 | -0.174 | -0.14 |
| 2.4881413816431 | -0.229 | -0.173 | -0.139 |
| 2.49128297429669 | -0.228 | -0.172 | -0.138 |
| 2.49442456695028 | -0.226 | -0.171 | -0.137 |
| 2.497566159603869 | -0.225 | -0.17 | -0.137 |
| 2.500707752257458 | -0.224 | -0.169 | -0.136 |
| 2.503849344911048 | -0.223 | -0.168 | -0.135 |
| 2.506990937564638 | -0.222 | -0.167 | -0.134 |
| 2.510132530218228 | -0.22 | -0.166 | -0.134 |
| 2.513274122871817 | -0.219 | -0.165 | -0.133 |
| 2.516415715525407 | -0.218 | -0.164 | -0.132 |
| 2.519557308178996 | -0.217 | -0.164 | -0.131 |
| 2.522698900832586 | -0.216 | -0.163 | -0.131 |
| 2.525840493486176 | -0.214 | -0.162 | -0.13 |
| 2.528982086139765 | -0.213 | -0.161 | -0.129 |
| 2.532123678793355 | -0.212 | -0.16 | -0.128 |
| 2.535265271446944 | -0.211 | -0.159 | -0.128 |
| 2.538406864100534 | -0.21 | -0.158 | -0.127 |
| 2.541548456754124 | -0.208 | -0.157 | -0.126 |
| 2.544690049407713 | -0.207 | -0.156 | -0.125 |
| 2.547831642061302 | -0.206 | -0.155 | -0.125 |
| 2.550973234714892 | -0.205 | -0.155 | -0.124 |
| 2.554114827368482 | -0.204 | -0.154 | -0.123 |
| 2.557256420022072 | -0.203 | -0.153 | -0.123 |
| 2.560398012675661 | -0.201 | -0.152 | -0.122 |
| 2.563539605329251 | -0.2 | -0.151 | -0.121 |
| 2.56668119798284 | -0.199 | -0.15 | -0.12 |
| 2.56982279063643 | -0.198 | -0.149 | -0.12 |
| 2.57296438329002 | -0.197 | -0.148 | -0.119 |
| 2.576105975943609 | -0.196 | -0.147 | -0.118 |
| 2.579247568597199 | -0.194 | -0.146 | -0.118 |
| 2.582389161250788 | -0.193 | -0.146 | -0.117 |
| 2.585530753904377 | -0.192 | -0.145 | -0.116 |
| 2.588672346557967 | -0.191 | -0.144 | -0.115 |
| 2.591813939211557 | -0.19 | -0.143 | -0.115 |
| 2.594955531865147 | -0.189 | -0.142 | -0.114 |
| 2.598097124518736 | -0.187 | -0.141 | -0.113 |
| 2.601238717172326 | -0.186 | -0.14 | -0.113 |
| 2.604380309825915 | -0.185 | -0.139 | -0.112 |
| 2.607521902479505 | -0.184 | -0.139 | -0.111 |
| 2.610663495133095 | -0.183 | -0.138 | -0.11 |
| 2.613805087786684 | -0.182 | -0.137 | -0.11 |
| 2.616946680440274 | -0.18 | -0.136 | -0.109 |
| 2.620088273093863 | -0.179 | -0.135 | -0.108 |
| 2.623229865747452 | -0.178 | -0.134 | -0.108 |
| 2.626371458401042 | -0.177 | -0.133 | -0.107 |
| 2.629513051054632 | -0.176 | -0.132 | -0.106 |
| 2.632654643708222 | -0.175 | -0.132 | -0.105 |
| 2.635796236361811 | -0.174 | -0.131 | -0.105 |
| 2.638937829015401 | -0.172 | -0.13 | -0.104 |
| 2.642079421668991 | -0.171 | -0.129 | -0.103 |
| 2.64522101432258 | -0.17 | -0.128 | -0.103 |
| 2.64836260697617 | -0.169 | -0.127 | -0.102 |
| 2.651504199629759 | -0.168 | -0.126 | -0.101 |
| 2.654645792283349 | -0.167 | -0.126 | -0.101 |
| 2.657787384936938 | -0.166 | -0.125 | -0.1 |
| 2.660928977590528 | -0.164 | -0.124 | -0.099 |
| 2.664070570244118 | -0.163 | -0.123 | -0.099 |
| 2.667212162897707 | -0.162 | -0.122 | -0.098 |
| 2.670353755551297 | -0.161 | -0.121 | -0.097 |
| 2.673495348204887 | -0.16 | -0.12 | -0.096 |
| 2.676636940858476 | -0.159 | -0.12 | -0.096 |
| 2.679778533512066 | -0.158 | -0.119 | -0.095 |
| 2.682920126165655 | -0.157 | -0.118 | -0.094 |
| 2.686061718819245 | -0.155 | -0.117 | -0.094 |
| 2.689203311472835 | -0.154 | -0.116 | -0.093 |
| 2.692344904126424 | -0.153 | -0.115 | -0.092 |
| 2.695486496780014 | -0.152 | -0.114 | -0.092 |
| 2.698628089433603 | -0.151 | -0.114 | -0.091 |
| 2.701769682087193 | -0.15 | -0.113 | -0.09 |
| 2.704911274740782 | -0.149 | -0.112 | -0.09 |
| 2.708052867394372 | -0.148 | -0.111 | -0.089 |
| 2.711194460047962 | -0.147 | -0.11 | -0.088 |
| 2.714336052701551 | -0.145 | -0.109 | -0.088 |
| 2.717477645355141 | -0.144 | -0.108 | -0.087 |
| 2.720619238008731 | -0.143 | -0.108 | -0.086 |
| 2.72376083066232 | -0.142 | -0.107 | -0.086 |
| 2.72690242331591 | -0.141 | -0.106 | -0.085 |
| 2.730044015969499 | -0.14 | -0.105 | -0.084 |
| 2.733185608623089 | -0.139 | -0.104 | -0.084 |
| 2.736327201276678 | -0.138 | -0.103 | -0.083 |
| 2.739468793930268 | -0.137 | -0.103 | -0.082 |
| 2.742610386583858 | -0.135 | -0.102 | -0.082 |
| 2.745751979237447 | -0.134 | -0.101 | -0.081 |
| 2.748893571891036 | -0.133 | -0.1 | -0.08 |
| 2.752035164544627 | -0.132 | -0.099 | -0.08 |
| 2.755176757198216 | -0.131 | -0.098 | -0.079 |
| 2.758318349851806 | -0.13 | -0.098 | -0.078 |
| 2.761459942505395 | -0.129 | -0.097 | -0.078 |
| 2.764601535158985 | -0.128 | -0.096 | -0.077 |
| 2.767743127812574 | -0.127 | -0.095 | -0.076 |
| 2.770884720466164 | -0.125 | -0.094 | -0.076 |
| 2.774026313119754 | -0.124 | -0.093 | -0.075 |
| 2.777167905773343 | -0.123 | -0.093 | -0.074 |
| 2.780309498426932 | -0.122 | -0.092 | -0.074 |
| 2.783451091080522 | -0.121 | -0.091 | -0.073 |
| 2.786592683734112 | -0.12 | -0.09 | -0.072 |
| 2.789734276387701 | -0.119 | -0.089 | -0.072 |
| 2.792875869041291 | -0.118 | -0.089 | -0.071 |
| 2.796017461694881 | -0.117 | -0.088 | -0.07 |
| 2.79915905434847 | -0.116 | -0.087 | -0.07 |
| 2.80230064700206 | -0.115 | -0.086 | -0.069 |
| 2.80544223965565 | -0.113 | -0.085 | -0.068 |
| 2.808583832309239 | -0.112 | -0.084 | -0.068 |
| 2.811725424962829 | -0.111 | -0.084 | -0.067 |
| 2.814867017616419 | -0.11 | -0.083 | -0.066 |
| 2.818008610270008 | -0.109 | -0.082 | -0.066 |
| 2.821150202923598 | -0.108 | -0.081 | -0.065 |
| 2.824291795577187 | -0.107 | -0.08 | -0.064 |
| 2.827433388230777 | -0.106 | -0.08 | -0.064 |
| 2.830574980884366 | -0.105 | -0.079 | -0.063 |
| 2.833716573537956 | -0.104 | -0.078 | -0.062 |
| 2.836858166191546 | -0.103 | -0.077 | -0.062 |
| 2.839999758845135 | -0.102 | -0.076 | -0.061 |
| 2.843141351498725 | -0.1 | -0.075 | -0.06 |
| 2.846282944152314 | -0.099 | -0.075 | -0.06 |
| 2.849424536805904 | -0.098 | -0.074 | -0.059 |
| 2.852566129459494 | -0.097 | -0.073 | -0.058 |
| 2.855707722113083 | -0.096 | -0.072 | -0.058 |
| 2.858849314766673 | -0.095 | -0.071 | -0.057 |
| 2.861990907420262 | -0.094 | -0.071 | -0.057 |
| 2.865132500073852 | -0.093 | -0.07 | -0.056 |
| 2.868274092727442 | -0.092 | -0.069 | -0.055 |
| 2.871415685381031 | -0.091 | -0.068 | -0.055 |
| 2.874557278034621 | -0.09 | -0.067 | -0.054 |
| 2.87769887068821 | -0.089 | -0.067 | -0.053 |
| 2.8808404633418 | -0.088 | -0.066 | -0.053 |
| 2.88398205599539 | -0.087 | -0.065 | -0.052 |
| 2.88712364864898 | -0.085 | -0.064 | -0.051 |
| 2.890265241302569 | -0.084 | -0.063 | -0.051 |
| 2.893406833956158 | -0.083 | -0.063 | -0.05 |
| 2.896548426609748 | -0.082 | -0.062 | -0.049 |
| 2.899690019263338 | -0.081 | -0.061 | -0.049 |
| 2.902831611916927 | -0.08 | -0.06 | -0.048 |
| 2.905973204570517 | -0.079 | -0.059 | -0.047 |
| 2.909114797224106 | -0.078 | -0.059 | -0.047 |
| 2.912256389877696 | -0.077 | -0.058 | -0.046 |
| 2.915397982531286 | -0.076 | -0.057 | -0.046 |
| 2.918539575184875 | -0.075 | -0.056 | -0.045 |
| 2.921681167838465 | -0.074 | -0.055 | -0.044 |
| 2.924822760492054 | -0.073 | -0.055 | -0.044 |
| 2.927964353145644 | -0.072 | -0.054 | -0.043 |
| 2.931105945799234 | -0.071 | -0.053 | -0.042 |
| 2.934247538452823 | -0.069 | -0.052 | -0.042 |
| 2.937389131106413 | -0.068 | -0.051 | -0.041 |
| 2.940530723760002 | -0.067 | -0.051 | -0.04 |
| 2.943672316413592 | -0.066 | -0.05 | -0.04 |
| 2.946813909067182 | -0.065 | -0.049 | -0.039 |
| 2.949955501720771 | -0.064 | -0.048 | -0.039 |
| 2.953097094374361 | -0.063 | -0.047 | -0.038 |
| 2.95623868702795 | -0.062 | -0.047 | -0.037 |
| 2.95938027968154 | -0.061 | -0.046 | -0.037 |
| 2.96252187233513 | -0.06 | -0.045 | -0.036 |
| 2.965663464988719 | -0.059 | -0.044 | -0.035 |
| 2.968805057642309 | -0.058 | -0.043 | -0.035 |
| 2.971946650295898 | -0.057 | -0.043 | -0.034 |
| 2.975088242949488 | -0.056 | -0.042 | -0.033 |
| 2.978229835603078 | -0.055 | -0.041 | -0.033 |
| 2.981371428256667 | -0.054 | -0.04 | -0.032 |
| 2.984513020910257 | -0.053 | -0.039 | -0.032 |
| 2.987654613563846 | -0.051 | -0.039 | -0.031 |
| 2.990796206217436 | -0.05 | -0.038 | -0.03 |
| 2.993937798871025 | -0.049 | -0.037 | -0.03 |
| 2.997079391524615 | -0.048 | -0.036 | -0.029 |
| 3.000220984178205 | -0.047 | -0.035 | -0.028 |
| 3.003362576831794 | -0.046 | -0.035 | -0.028 |
| 3.006504169485384 | -0.045 | -0.034 | -0.027 |
| 3.009645762138974 | -0.044 | -0.033 | -0.026 |
| 3.012787354792563 | -0.043 | -0.032 | -0.026 |
| 3.015928947446153 | -0.042 | -0.031 | -0.025 |
| 3.019070540099742 | -0.041 | -0.031 | -0.025 |
| 3.022212132753332 | -0.04 | -0.03 | -0.024 |
| 3.025353725406922 | -0.039 | -0.029 | -0.023 |
| 3.028495318060511 | -0.038 | -0.028 | -0.023 |
| 3.031636910714101 | -0.037 | -0.028 | -0.022 |
| 3.03477850336769 | -0.036 | -0.027 | -0.021 |
| 3.03792009602128 | -0.035 | -0.026 | -0.021 |
| 3.04106168867487 | -0.034 | -0.025 | -0.02 |
| 3.04420328132846 | -0.032 | -0.024 | -0.02 |
| 3.047344873982049 | -0.031 | -0.024 | -0.019 |
| 3.050486466635638 | -0.03 | -0.023 | -0.018 |
| 3.053628059289228 | -0.029 | -0.022 | -0.018 |
| 3.056769651942818 | -0.028 | -0.021 | -0.017 |
| 3.059911244596407 | -0.027 | -0.02 | -0.016 |
| 3.063052837249997 | -0.026 | -0.02 | -0.016 |
| 3.066194429903586 | -0.025 | -0.019 | -0.015 |
| 3.069336022557176 | -0.024 | -0.018 | -0.014 |
| 3.072477615210766 | -0.023 | -0.017 | -0.014 |
| 3.075619207864355 | -0.022 | -0.017 | -0.013 |
| 3.078760800517945 | -0.021 | -0.016 | -0.013 |
| 3.081902393171534 | -0.02 | -0.015 | -0.012 |
| 3.085043985825124 | -0.019 | -0.014 | -0.011 |
| 3.088185578478713 | -0.018 | -0.013 | -0.011 |
| 3.091327171132303 | -0.017 | -0.013 | -0.01 |
| 3.094468763785893 | -0.016 | -0.012 | -0.009 |
| 3.097610356439482 | -0.015 | -0.011 | -0.009 |
| 3.100751949093072 | -0.014 | -0.01 | -0.008 |
| 3.103893541746661 | -0.013 | -0.009 | -0.008 |
| 3.107035134400251 | -0.012 | -0.009 | -0.007 |
| 3.110176727053841 | -0.01 | -0.008 | -0.006 |
| 3.11331831970743 | -0.009 | -0.007 | -0.006 |
| 3.11645991236102 | -0.008 | -0.006 | -0.005 |
| 3.11960150501461 | -0.007 | -0.005 | -0.004 |
| 3.122743097668199 | -0.006 | -0.005 | -0.004 |
| 3.125884690321789 | -0.005 | -0.004 | -0.003 |
| 3.129026282975378 | -0.004 | -0.003 | -0.003 |
| 3.132167875628968 | -0.003 | -0.002 | -0.002 |
| 3.135309468282557 | -0.002 | -0.002 | -0.001 |
| 3.138451060936147 | -0.001 | -0.001 | -0.001 |
| 3.141592653589737 | 0 | 0 | 0 |
| 3.144734246243326 | 0.001 | 0.001 | 0.001 |
| 3.147875838896916 | 0.002 | 0.002 | 0.001 |
| 3.151017431550505 | 0.003 | 0.002 | 0.002 |
| 3.154159024204095 | 0.004 | 0.003 | 0.003 |
| 3.157300616857685 | 0.005 | 0.004 | 0.003 |
| 3.160442209511274 | 0.006 | 0.005 | 0.004 |
| 3.163583802164864 | 0.007 | 0.005 | 0.004 |
| 3.166725394818453 | 0.008 | 0.006 | 0.005 |
| 3.169866987472043 | 0.009 | 0.007 | 0.006 |
| 3.173008580125633 | 0.01 | 0.008 | 0.006 |
| 3.176150172779222 | 0.012 | 0.009 | 0.007 |
| 3.179291765432812 | 0.013 | 0.009 | 0.008 |
| 3.182433358086401 | 0.014 | 0.01 | 0.008 |
| 3.185574950739991 | 0.015 | 0.011 | 0.009 |
| 3.188716543393581 | 0.016 | 0.012 | 0.009 |
| 3.19185813604717 | 0.017 | 0.013 | 0.01 |
| 3.19499972870076 | 0.018 | 0.013 | 0.011 |
| 3.198141321354349 | 0.019 | 0.014 | 0.011 |
| 3.20128291400794 | 0.02 | 0.015 | 0.012 |
| 3.204424506661528 | 0.021 | 0.016 | 0.013 |
| 3.207566099315118 | 0.022 | 0.017 | 0.013 |
| 3.210707691968708 | 0.023 | 0.017 | 0.014 |
| 3.213849284622297 | 0.024 | 0.018 | 0.014 |
| 3.216990877275887 | 0.025 | 0.019 | 0.015 |
| 3.220132469929476 | 0.026 | 0.02 | 0.016 |
| 3.223274062583066 | 0.027 | 0.02 | 0.016 |
| 3.226415655236656 | 0.028 | 0.021 | 0.017 |
| 3.229557247890245 | 0.029 | 0.022 | 0.018 |
| 3.232698840543835 | 0.03 | 0.023 | 0.018 |
| 3.235840433197425 | 0.031 | 0.024 | 0.019 |
| 3.238982025851014 | 0.032 | 0.024 | 0.02 |
| 3.242123618504604 | 0.034 | 0.025 | 0.02 |
| 3.245265211158193 | 0.035 | 0.026 | 0.021 |
| 3.248406803811783 | 0.036 | 0.027 | 0.021 |
| 3.251548396465373 | 0.037 | 0.028 | 0.022 |
| 3.254689989118962 | 0.038 | 0.028 | 0.023 |
| 3.257831581772551 | 0.039 | 0.029 | 0.023 |
| 3.260973174426141 | 0.04 | 0.03 | 0.024 |
| 3.26411476707973 | 0.041 | 0.031 | 0.025 |
| 3.267256359733321 | 0.042 | 0.031 | 0.025 |
| 3.27039795238691 | 0.043 | 0.032 | 0.026 |
| 3.2735395450405 | 0.044 | 0.033 | 0.026 |
| 3.276681137694089 | 0.045 | 0.034 | 0.027 |
| 3.279822730347679 | 0.046 | 0.035 | 0.028 |
| 3.282964323001269 | 0.047 | 0.035 | 0.028 |
| 3.286105915654858 | 0.048 | 0.036 | 0.029 |
| 3.289247508308448 | 0.049 | 0.037 | 0.03 |
| 3.292389100962037 | 0.05 | 0.038 | 0.03 |
| 3.295530693615627 | 0.051 | 0.039 | 0.031 |
| 3.298672286269217 | 0.053 | 0.039 | 0.032 |
| 3.301813878922806 | 0.054 | 0.04 | 0.032 |
| 3.304955471576396 | 0.055 | 0.041 | 0.033 |
| 3.308097064229985 | 0.056 | 0.042 | 0.033 |
| 3.311238656883575 | 0.057 | 0.043 | 0.034 |
| 3.314380249537165 | 0.058 | 0.043 | 0.035 |
| 3.317521842190754 | 0.059 | 0.044 | 0.035 |
| 3.320663434844344 | 0.06 | 0.045 | 0.036 |
| 3.323805027497933 | 0.061 | 0.046 | 0.037 |
| 3.326946620151523 | 0.062 | 0.047 | 0.037 |
| 3.330088212805113 | 0.063 | 0.047 | 0.038 |
| 3.333229805458702 | 0.064 | 0.048 | 0.039 |
| 3.336371398112292 | 0.065 | 0.049 | 0.039 |
| 3.339512990765881 | 0.066 | 0.05 | 0.04 |
| 3.342654583419471 | 0.067 | 0.051 | 0.04 |
| 3.345796176073061 | 0.068 | 0.051 | 0.041 |
| 3.34893776872665 | 0.069 | 0.052 | 0.042 |
| 3.35207936138024 | 0.071 | 0.053 | 0.042 |
| 3.355220954033829 | 0.072 | 0.054 | 0.043 |
| 3.358362546687419 | 0.073 | 0.055 | 0.044 |
| 3.361504139341009 | 0.074 | 0.055 | 0.044 |
| 3.364645731994598 | 0.075 | 0.056 | 0.045 |
| 3.367787324648188 | 0.076 | 0.057 | 0.046 |
| 3.370928917301777 | 0.077 | 0.058 | 0.046 |
| 3.374070509955367 | 0.078 | 0.059 | 0.047 |
| 3.377212102608956 | 0.079 | 0.059 | 0.047 |
| 3.380353695262546 | 0.08 | 0.06 | 0.048 |
| 3.383495287916136 | 0.081 | 0.061 | 0.049 |
| 3.386636880569725 | 0.082 | 0.062 | 0.049 |
| 3.389778473223315 | 0.083 | 0.063 | 0.05 |
| 3.392920065876904 | 0.084 | 0.063 | 0.051 |
| 3.396061658530494 | 0.085 | 0.064 | 0.051 |
| 3.399203251184084 | 0.087 | 0.065 | 0.052 |
| 3.402344843837673 | 0.088 | 0.066 | 0.053 |
| 3.405486436491263 | 0.089 | 0.067 | 0.053 |
| 3.408628029144852 | 0.09 | 0.067 | 0.054 |
| 3.411769621798442 | 0.091 | 0.068 | 0.055 |
| 3.414911214452032 | 0.092 | 0.069 | 0.055 |
| 3.418052807105621 | 0.093 | 0.07 | 0.056 |
| 3.421194399759211 | 0.094 | 0.071 | 0.057 |
| 3.4243359924128 | 0.095 | 0.071 | 0.057 |
| 3.42747758506639 | 0.096 | 0.072 | 0.058 |
| 3.43061917771998 | 0.097 | 0.073 | 0.058 |
| 3.433760770373569 | 0.098 | 0.074 | 0.059 |
| 3.436902363027159 | 0.099 | 0.075 | 0.06 |
| 3.440043955680748 | 0.1 | 0.075 | 0.06 |
| 3.443185548334338 | 0.102 | 0.076 | 0.061 |
| 3.446327140987927 | 0.103 | 0.077 | 0.062 |
| 3.449468733641517 | 0.104 | 0.078 | 0.062 |
| 3.452610326295107 | 0.105 | 0.079 | 0.063 |
| 3.455751918948696 | 0.106 | 0.08 | 0.064 |
| 3.458893511602286 | 0.107 | 0.08 | 0.064 |
| 3.462035104255876 | 0.108 | 0.081 | 0.065 |
| 3.465176696909465 | 0.109 | 0.082 | 0.066 |
| 3.468318289563055 | 0.11 | 0.083 | 0.066 |
| 3.471459882216644 | 0.111 | 0.084 | 0.067 |
| 3.474601474870234 | 0.112 | 0.084 | 0.068 |
| 3.477743067523824 | 0.113 | 0.085 | 0.068 |
| 3.480884660177413 | 0.115 | 0.086 | 0.069 |
| 3.484026252831002 | 0.116 | 0.087 | 0.07 |
| 3.487167845484592 | 0.117 | 0.088 | 0.07 |
| 3.490309438138182 | 0.118 | 0.089 | 0.071 |
| 3.493451030791772 | 0.119 | 0.089 | 0.072 |
| 3.496592623445361 | 0.12 | 0.09 | 0.072 |
| 3.499734216098951 | 0.121 | 0.091 | 0.073 |
| 3.50287580875254 | 0.122 | 0.092 | 0.074 |
| 3.50601740140613 | 0.123 | 0.093 | 0.074 |
| 3.50915899405972 | 0.124 | 0.093 | 0.075 |
| 3.512300586713309 | 0.125 | 0.094 | 0.076 |
| 3.515442179366899 | 0.127 | 0.095 | 0.076 |
| 3.518583772020488 | 0.128 | 0.096 | 0.077 |
| 3.521725364674078 | 0.129 | 0.097 | 0.078 |
| 3.524866957327668 | 0.13 | 0.098 | 0.078 |
| 3.528008549981257 | 0.131 | 0.098 | 0.079 |
| 3.531150142634847 | 0.132 | 0.099 | 0.08 |
| 3.534291735288436 | 0.133 | 0.1 | 0.08 |
| 3.537433327942026 | 0.134 | 0.101 | 0.081 |
| 3.540574920595616 | 0.135 | 0.102 | 0.082 |
| 3.543716513249205 | 0.137 | 0.103 | 0.082 |
| 3.546858105902795 | 0.138 | 0.103 | 0.083 |
| 3.549999698556384 | 0.139 | 0.104 | 0.084 |
| 3.553141291209974 | 0.14 | 0.105 | 0.084 |
| 3.556282883863564 | 0.141 | 0.106 | 0.085 |
| 3.559424476517153 | 0.142 | 0.107 | 0.086 |
| 3.562566069170743 | 0.143 | 0.108 | 0.086 |
| 3.565707661824332 | 0.144 | 0.108 | 0.087 |
| 3.568849254477922 | 0.145 | 0.109 | 0.088 |
| 3.571990847131511 | 0.147 | 0.11 | 0.088 |
| 3.575132439785101 | 0.148 | 0.111 | 0.089 |
| 3.578274032438691 | 0.149 | 0.112 | 0.09 |
| 3.58141562509228 | 0.15 | 0.113 | 0.09 |
| 3.58455721774587 | 0.151 | 0.114 | 0.091 |
| 3.58769881039946 | 0.152 | 0.114 | 0.092 |
| 3.590840403053049 | 0.153 | 0.115 | 0.092 |
| 3.593981995706639 | 0.154 | 0.116 | 0.093 |
| 3.597123588360228 | 0.155 | 0.117 | 0.094 |
| 3.600265181013818 | 0.157 | 0.118 | 0.094 |
| 3.603406773667407 | 0.158 | 0.119 | 0.095 |
| 3.606548366320997 | 0.159 | 0.12 | 0.096 |
| 3.609689958974587 | 0.16 | 0.12 | 0.096 |
| 3.612831551628176 | 0.161 | 0.121 | 0.097 |
| 3.615973144281766 | 0.162 | 0.122 | 0.098 |
| 3.619114736935355 | 0.163 | 0.123 | 0.099 |
| 3.622256329588945 | 0.164 | 0.124 | 0.099 |
| 3.625397922242534 | 0.166 | 0.125 | 0.1 |
| 3.628539514896124 | 0.167 | 0.126 | 0.101 |
| 3.631681107549714 | 0.168 | 0.126 | 0.101 |
| 3.634822700203303 | 0.169 | 0.127 | 0.102 |
| 3.637964292856893 | 0.17 | 0.128 | 0.103 |
| 3.641105885510483 | 0.171 | 0.129 | 0.103 |
| 3.644247478164072 | 0.172 | 0.13 | 0.104 |
| 3.647389070817662 | 0.174 | 0.131 | 0.105 |
| 3.650530663471251 | 0.175 | 0.132 | 0.105 |
| 3.653672256124841 | 0.176 | 0.132 | 0.106 |
| 3.656813848778431 | 0.177 | 0.133 | 0.107 |
| 3.65995544143202 | 0.178 | 0.134 | 0.108 |
| 3.66309703408561 | 0.179 | 0.135 | 0.108 |
| 3.666238626739199 | 0.18 | 0.136 | 0.109 |
| 3.66938021939279 | 0.182 | 0.137 | 0.11 |
| 3.672521812046378 | 0.183 | 0.138 | 0.11 |
| 3.675663404699968 | 0.184 | 0.139 | 0.111 |
| 3.678804997353558 | 0.185 | 0.139 | 0.112 |
| 3.681946590007147 | 0.186 | 0.14 | 0.113 |
| 3.685088182660737 | 0.187 | 0.141 | 0.113 |
| 3.688229775314326 | 0.189 | 0.142 | 0.114 |
| 3.691371367967916 | 0.19 | 0.143 | 0.115 |
| 3.694512960621506 | 0.191 | 0.144 | 0.115 |
| 3.697654553275095 | 0.192 | 0.145 | 0.116 |
| 3.700796145928685 | 0.193 | 0.146 | 0.117 |
| 3.703937738582274 | 0.194 | 0.146 | 0.118 |
| 3.707079331235864 | 0.196 | 0.147 | 0.118 |
| 3.710220923889454 | 0.197 | 0.148 | 0.119 |
| 3.713362516543043 | 0.198 | 0.149 | 0.12 |
| 3.716504109196633 | 0.199 | 0.15 | 0.12 |
| 3.719645701850223 | 0.2 | 0.151 | 0.121 |
| 3.722787294503812 | 0.201 | 0.152 | 0.122 |
| 3.725928887157402 | 0.203 | 0.153 | 0.123 |
| 3.729070479810991 | 0.204 | 0.154 | 0.123 |
| 3.732212072464581 | 0.205 | 0.155 | 0.124 |
| 3.735353665118171 | 0.206 | 0.155 | 0.125 |
| 3.73849525777176 | 0.207 | 0.156 | 0.125 |
| 3.74163685042535 | 0.208 | 0.157 | 0.126 |
| 3.744778443078939 | 0.21 | 0.158 | 0.127 |
| 3.747920035732529 | 0.211 | 0.159 | 0.128 |
| 3.751061628386119 | 0.212 | 0.16 | 0.128 |
| 3.754203221039708 | 0.213 | 0.161 | 0.129 |
| 3.757344813693298 | 0.214 | 0.162 | 0.13 |
| 3.760486406346887 | 0.216 | 0.163 | 0.131 |
| 3.763627999000477 | 0.217 | 0.164 | 0.131 |
| 3.766769591654067 | 0.218 | 0.164 | 0.132 |
| 3.769911184307656 | 0.219 | 0.165 | 0.133 |
| 3.773052776961246 | 0.22 | 0.166 | 0.134 |
| 3.776194369614835 | 0.222 | 0.167 | 0.134 |
| 3.779335962268425 | 0.223 | 0.168 | 0.135 |
| 3.782477554922014 | 0.224 | 0.169 | 0.136 |
| 3.785619147575604 | 0.225 | 0.17 | 0.137 |
| 3.788760740229193 | 0.226 | 0.171 | 0.137 |
| 3.791902332882783 | 0.228 | 0.172 | 0.138 |
| 3.795043925536373 | 0.229 | 0.173 | 0.139 |
| 3.798185518189962 | 0.23 | 0.174 | 0.14 |
| 3.801327110843552 | 0.231 | 0.175 | 0.14 |
| 3.804468703497142 | 0.233 | 0.176 | 0.141 |
| 3.807610296150731 | 0.234 | 0.177 | 0.142 |
| 3.810751888804321 | 0.235 | 0.177 | 0.143 |
| 3.813893481457911 | 0.236 | 0.178 | 0.143 |
| 3.8170350741115 | 0.237 | 0.179 | 0.144 |
| 3.82017666676509 | 0.239 | 0.18 | 0.145 |
| 3.823318259418679 | 0.24 | 0.181 | 0.146 |
| 3.826459852072269 | 0.241 | 0.182 | 0.146 |
| 3.829601444725859 | 0.242 | 0.183 | 0.147 |
| 3.832743037379448 | 0.244 | 0.184 | 0.148 |
| 3.835884630033038 | 0.245 | 0.185 | 0.149 |
| 3.839026222686627 | 0.246 | 0.186 | 0.149 |
| 3.842167815340217 | 0.247 | 0.187 | 0.15 |
| 3.845309407993807 | 0.249 | 0.188 | 0.151 |
| 3.848451000647396 | 0.25 | 0.189 | 0.152 |
| 3.851592593300986 | 0.251 | 0.19 | 0.153 |
| 3.854734185954575 | 0.252 | 0.191 | 0.153 |
| 3.857875778608165 | 0.254 | 0.192 | 0.154 |
| 3.861017371261755 | 0.255 | 0.193 | 0.155 |
| 3.864158963915344 | 0.256 | 0.194 | 0.156 |
| 3.867300556568933 | 0.257 | 0.195 | 0.156 |
| 3.870442149222523 | 0.259 | 0.196 | 0.157 |
| 3.873583741876112 | 0.26 | 0.197 | 0.158 |
| 3.876725334529703 | 0.261 | 0.198 | 0.159 |
| 3.879866927183292 | 0.262 | 0.198 | 0.16 |
| 3.883008519836882 | 0.264 | 0.199 | 0.16 |
| 3.886150112490471 | 0.265 | 0.2 | 0.161 |
| 3.889291705144061 | 0.266 | 0.201 | 0.162 |
| 3.892433297797651 | 0.267 | 0.202 | 0.163 |
| 3.89557489045124 | 0.269 | 0.203 | 0.164 |
| 3.89871648310483 | 0.27 | 0.204 | 0.164 |
| 3.901858075758419 | 0.271 | 0.205 | 0.165 |
| 3.904999668412009 | 0.273 | 0.206 | 0.166 |
| 3.908141261065598 | 0.274 | 0.207 | 0.167 |
| 3.911282853719188 | 0.275 | 0.208 | 0.168 |
| 3.914424446372778 | 0.276 | 0.209 | 0.168 |
| 3.917566039026367 | 0.278 | 0.21 | 0.169 |
| 3.920707631679957 | 0.279 | 0.211 | 0.17 |
| 3.923849224333547 | 0.28 | 0.212 | 0.171 |
| 3.926990816987136 | 0.282 | 0.213 | 0.172 |
| 3.930132409640726 | 0.283 | 0.214 | 0.173 |
| 3.933274002294315 | 0.284 | 0.215 | 0.173 |
| 3.936415594947905 | 0.286 | 0.216 | 0.174 |
| 3.939557187601495 | 0.287 | 0.217 | 0.175 |
| 3.942698780255084 | 0.288 | 0.218 | 0.176 |
| 3.945840372908674 | 0.289 | 0.219 | 0.177 |
| 3.948981965562263 | 0.291 | 0.22 | 0.178 |
| 3.952123558215853 | 0.292 | 0.221 | 0.178 |
| 3.955265150869442 | 0.293 | 0.223 | 0.179 |
| 3.958406743523032 | 0.295 | 0.224 | 0.18 |
| 3.961548336176622 | 0.296 | 0.225 | 0.181 |
| 3.964689928830211 | 0.297 | 0.226 | 0.182 |
| 3.967831521483801 | 0.299 | 0.227 | 0.183 |
| 3.97097311413739 | 0.3 | 0.228 | 0.183 |
| 3.97411470679098 | 0.301 | 0.229 | 0.184 |
| 3.97725629944457 | 0.303 | 0.23 | 0.185 |
| 3.98039789209816 | 0.304 | 0.231 | 0.186 |
| 3.983539484751749 | 0.305 | 0.232 | 0.187 |
| 3.986681077405338 | 0.307 | 0.233 | 0.188 |
| 3.989822670058928 | 0.308 | 0.234 | 0.189 |
| 3.992964262712517 | 0.309 | 0.235 | 0.189 |
| 3.996105855366107 | 0.311 | 0.236 | 0.19 |
| 3.999247448019697 | 0.312 | 0.237 | 0.191 |
| 4.002389040673287 | 0.314 | 0.238 | 0.192 |
| 4.005530633326877 | 0.315 | 0.239 | 0.193 |
| 4.008672225980466 | 0.316 | 0.24 | 0.194 |
| 4.011813818634056 | 0.318 | 0.241 | 0.195 |
| 4.014955411287645 | 0.319 | 0.242 | 0.196 |
| 4.018097003941234 | 0.32 | 0.244 | 0.196 |
| 4.021238596594824 | 0.322 | 0.245 | 0.197 |
| 4.024380189248414 | 0.323 | 0.246 | 0.198 |
| 4.027521781902004 | 0.325 | 0.247 | 0.199 |
| 4.030663374555593 | 0.326 | 0.248 | 0.2 |
| 4.033804967209183 | 0.327 | 0.249 | 0.201 |
| 4.036946559862773 | 0.329 | 0.25 | 0.202 |
| 4.040088152516362 | 0.33 | 0.251 | 0.203 |
| 4.043229745169951 | 0.332 | 0.252 | 0.204 |
| 4.046371337823541 | 0.333 | 0.253 | 0.204 |
| 4.049512930477131 | 0.334 | 0.254 | 0.205 |
| 4.05265452313072 | 0.336 | 0.256 | 0.206 |
| 4.05579611578431 | 0.337 | 0.257 | 0.207 |
| 4.0589377084379 | 0.339 | 0.258 | 0.208 |
| 4.062079301091489 | 0.34 | 0.259 | 0.209 |
| 4.065220893745079 | 0.341 | 0.26 | 0.21 |
| 4.068362486398668 | 0.343 | 0.261 | 0.211 |
| 4.071504079052258 | 0.344 | 0.262 | 0.212 |
| 4.074645671705848 | 0.346 | 0.263 | 0.213 |
| 4.077787264359437 | 0.347 | 0.264 | 0.214 |
| 4.080928857013027 | 0.349 | 0.266 | 0.215 |
| 4.084070449666616 | 0.35 | 0.267 | 0.216 |
| 4.087212042320206 | 0.351 | 0.268 | 0.216 |
| 4.090353634973795 | 0.353 | 0.269 | 0.217 |
| 4.093495227627385 | 0.354 | 0.27 | 0.218 |
| 4.096636820280975 | 0.356 | 0.271 | 0.219 |
| 4.099778412934564 | 0.357 | 0.272 | 0.22 |
| 4.102920005588154 | 0.359 | 0.274 | 0.221 |
| 4.106061598241744 | 0.36 | 0.275 | 0.222 |
| 4.109203190895333 | 0.362 | 0.276 | 0.223 |
| 4.112344783548923 | 0.363 | 0.277 | 0.224 |
| 4.115486376202512 | 0.365 | 0.278 | 0.225 |
| 4.118627968856102 | 0.366 | 0.279 | 0.226 |
| 4.121769561509692 | 0.368 | 0.281 | 0.227 |
| 4.124911154163281 | 0.369 | 0.282 | 0.228 |
| 4.128052746816871 | 0.371 | 0.283 | 0.229 |
| 4.13119433947046 | 0.372 | 0.284 | 0.23 |
| 4.13433593212405 | 0.374 | 0.285 | 0.231 |
| 4.13747752477764 | 0.375 | 0.287 | 0.232 |
| 4.14061911743123 | 0.377 | 0.288 | 0.233 |
| 4.143760710084818 | 0.378 | 0.289 | 0.234 |
| 4.146902302738408 | 0.38 | 0.29 | 0.235 |
| 4.150043895391998 | 0.381 | 0.291 | 0.236 |
| 4.153185488045588 | 0.383 | 0.293 | 0.237 |
| 4.156327080699177 | 0.384 | 0.294 | 0.238 |
| 4.159468673352766 | 0.386 | 0.295 | 0.239 |
| 4.162610266006356 | 0.387 | 0.296 | 0.24 |
| 4.165751858659946 | 0.389 | 0.297 | 0.241 |
| 4.168893451313535 | 0.39 | 0.299 | 0.242 |
| 4.172035043967125 | 0.392 | 0.3 | 0.243 |
| 4.175176636620715 | 0.393 | 0.301 | 0.244 |
| 4.178318229274304 | 0.395 | 0.302 | 0.245 |
| 4.181459821927894 | 0.397 | 0.304 | 0.246 |
| 4.184601414581484 | 0.398 | 0.305 | 0.247 |
| 4.187743007235073 | 0.4 | 0.306 | 0.248 |
| 4.190884599888663 | 0.401 | 0.307 | 0.249 |
| 4.194026192542252 | 0.403 | 0.309 | 0.25 |
| 4.197167785195842 | 0.404 | 0.31 | 0.251 |
| 4.200309377849432 | 0.406 | 0.311 | 0.252 |
| 4.203450970503021 | 0.408 | 0.312 | 0.253 |
| 4.206592563156611 | 0.409 | 0.314 | 0.254 |
| 4.2097341558102 | 0.411 | 0.315 | 0.256 |
| 4.21287574846379 | 0.412 | 0.316 | 0.257 |
| 4.21601734111738 | 0.414 | 0.318 | 0.258 |
| 4.21915893377097 | 0.416 | 0.319 | 0.259 |
| 4.222300526424559 | 0.417 | 0.32 | 0.26 |
| 4.225442119078148 | 0.419 | 0.321 | 0.261 |
| 4.228583711731738 | 0.42 | 0.323 | 0.262 |
| 4.231725304385327 | 0.422 | 0.324 | 0.263 |
| 4.234866897038917 | 0.424 | 0.325 | 0.264 |
| 4.238008489692506 | 0.425 | 0.327 | 0.265 |
| 4.241150082346096 | 0.427 | 0.328 | 0.267 |
| 4.244291674999685 | 0.429 | 0.329 | 0.268 |
| 4.247433267653276 | 0.43 | 0.331 | 0.269 |
| 4.250574860306865 | 0.432 | 0.332 | 0.27 |
| 4.253716452960455 | 0.434 | 0.333 | 0.271 |
| 4.256858045614044 | 0.435 | 0.335 | 0.272 |
| 4.259999638267634 | 0.437 | 0.336 | 0.273 |
| 4.263141230921224 | 0.439 | 0.338 | 0.274 |
| 4.266282823574813 | 0.44 | 0.339 | 0.276 |
| 4.269424416228403 | 0.442 | 0.34 | 0.277 |
| 4.272566008881992 | 0.444 | 0.342 | 0.278 |
| 4.275707601535582 | 0.445 | 0.343 | 0.279 |
| 4.27884919418917 | 0.447 | 0.344 | 0.28 |
| 4.28199078684276 | 0.449 | 0.346 | 0.281 |
| 4.285132379496351 | 0.451 | 0.347 | 0.283 |
| 4.28827397214994 | 0.452 | 0.349 | 0.284 |
| 4.29141556480353 | 0.454 | 0.35 | 0.285 |
| 4.294557157457119 | 0.456 | 0.351 | 0.286 |
| 4.29769875011071 | 0.457 | 0.353 | 0.287 |
| 4.300840342764299 | 0.459 | 0.354 | 0.289 |
| 4.303981935417888 | 0.461 | 0.356 | 0.29 |
| 4.307123528071478 | 0.463 | 0.357 | 0.291 |
| 4.310265120725067 | 0.464 | 0.359 | 0.292 |
| 4.313406713378657 | 0.466 | 0.36 | 0.293 |
| 4.316548306032247 | 0.468 | 0.361 | 0.295 |
| 4.319689898685836 | 0.47 | 0.363 | 0.296 |
| 4.322831491339426 | 0.472 | 0.364 | 0.297 |
| 4.325973083993015 | 0.473 | 0.366 | 0.298 |
| 4.329114676646605 | 0.475 | 0.367 | 0.3 |
| 4.332256269300195 | 0.477 | 0.369 | 0.301 |
| 4.335397861953784 | 0.479 | 0.37 | 0.302 |
| 4.338539454607374 | 0.481 | 0.372 | 0.303 |
| 4.341681047260963 | 0.482 | 0.373 | 0.305 |
| 4.344822639914553 | 0.484 | 0.375 | 0.306 |
| 4.347964232568143 | 0.486 | 0.376 | 0.307 |
| 4.351105825221732 | 0.488 | 0.378 | 0.309 |
| 4.354247417875322 | 0.49 | 0.379 | 0.31 |
| 4.357389010528911 | 0.492 | 0.381 | 0.311 |
| 4.360530603182501 | 0.493 | 0.382 | 0.313 |
| 4.36367219583609 | 0.495 | 0.384 | 0.314 |
| 4.36681378848968 | 0.497 | 0.386 | 0.315 |
| 4.36995538114327 | 0.499 | 0.387 | 0.317 |
| 4.373096973796859 | 0.501 | 0.389 | 0.318 |
| 4.376238566450449 | 0.503 | 0.39 | 0.319 |
| 4.379380159104038 | 0.505 | 0.392 | 0.321 |
| 4.382521751757628 | 0.507 | 0.393 | 0.322 |
| 4.385663344411217 | 0.508 | 0.395 | 0.323 |
| 4.388804937064807 | 0.51 | 0.397 | 0.325 |
| 4.391946529718397 | 0.512 | 0.398 | 0.326 |
| 4.395088122371987 | 0.514 | 0.4 | 0.327 |
| 4.398229715025576 | 0.516 | 0.401 | 0.329 |
| 4.401371307679165 | 0.518 | 0.403 | 0.33 |
| 4.404512900332755 | 0.52 | 0.405 | 0.332 |
| 4.407654492986345 | 0.522 | 0.406 | 0.333 |
| 4.410796085639934 | 0.524 | 0.408 | 0.335 |
| 4.413937678293524 | 0.526 | 0.41 | 0.336 |
| 4.417079270947114 | 0.528 | 0.411 | 0.337 |
| 4.420220863600703 | 0.53 | 0.413 | 0.339 |
| 4.423362456254293 | 0.532 | 0.415 | 0.34 |
| 4.426504048907883 | 0.534 | 0.416 | 0.342 |
| 4.429645641561472 | 0.536 | 0.418 | 0.343 |
| 4.432787234215062 | 0.538 | 0.42 | 0.345 |
| 4.435928826868651 | 0.54 | 0.422 | 0.346 |
| 4.43907041952224 | 0.542 | 0.423 | 0.348 |
| 4.44221201217583 | 0.544 | 0.425 | 0.349 |
| 4.44535360482942 | 0.546 | 0.427 | 0.351 |
| 4.44849519748301 | 0.548 | 0.429 | 0.352 |
| 4.4516367901366 | 0.55 | 0.43 | 0.354 |
| 4.454778382790188 | 0.552 | 0.432 | 0.355 |
| 4.457919975443779 | 0.554 | 0.434 | 0.357 |
| 4.461061568097368 | 0.557 | 0.436 | 0.359 |
| 4.464203160750958 | 0.559 | 0.438 | 0.36 |
| 4.467344753404547 | 0.561 | 0.439 | 0.362 |
| 4.470486346058137 | 0.563 | 0.441 | 0.363 |
| 4.473627938711726 | 0.565 | 0.443 | 0.365 |
| 4.476769531365316 | 0.567 | 0.445 | 0.367 |
| 4.479911124018905 | 0.569 | 0.447 | 0.368 |
| 4.483052716672495 | 0.571 | 0.449 | 0.37 |
| 4.486194309326085 | 0.574 | 0.45 | 0.372 |
| 4.489335901979674 | 0.576 | 0.452 | 0.373 |
| 4.492477494633264 | 0.578 | 0.454 | 0.375 |
| 4.495619087286854 | 0.58 | 0.456 | 0.377 |
| 4.498760679940443 | 0.582 | 0.458 | 0.378 |
| 4.501902272594033 | 0.585 | 0.46 | 0.38 |
| 4.505043865247622 | 0.587 | 0.462 | 0.382 |
| 4.508185457901212 | 0.589 | 0.464 | 0.383 |
| 4.511327050554801 | 0.591 | 0.466 | 0.385 |
| 4.514468643208391 | 0.594 | 0.468 | 0.387 |
| 4.517610235861981 | 0.596 | 0.47 | 0.389 |
| 4.520751828515571 | 0.598 | 0.472 | 0.39 |
| 4.52389342116916 | 0.6 | 0.474 | 0.392 |
| 4.52703501382275 | 0.603 | 0.476 | 0.394 |
| 4.530176606476339 | 0.605 | 0.478 | 0.396 |
| 4.533318199129928 | 0.607 | 0.48 | 0.398 |
| 4.536459791783518 | 0.61 | 0.482 | 0.4 |
| 4.539601384437108 | 0.612 | 0.484 | 0.401 |
| 4.542742977090698 | 0.614 | 0.486 | 0.403 |
| 4.545884569744287 | 0.617 | 0.488 | 0.405 |
| 4.549026162397876 | 0.619 | 0.49 | 0.407 |
| 4.552167755051466 | 0.621 | 0.492 | 0.409 |
| 4.555309347705056 | 0.624 | 0.494 | 0.411 |
| 4.558450940358646 | 0.626 | 0.497 | 0.413 |
| 4.561592533012235 | 0.629 | 0.499 | 0.415 |
| 4.564734125665825 | 0.631 | 0.501 | 0.417 |
| 4.567875718319415 | 0.633 | 0.503 | 0.419 |
| 4.571017310973004 | 0.636 | 0.505 | 0.421 |
| 4.574158903626594 | 0.638 | 0.508 | 0.423 |
| 4.577300496280183 | 0.641 | 0.51 | 0.425 |
| 4.580442088933772 | 0.643 | 0.512 | 0.427 |
| 4.583583681587362 | 0.646 | 0.514 | 0.429 |
| 4.586725274240952 | 0.648 | 0.517 | 0.431 |
| 4.589866866894542 | 0.651 | 0.519 | 0.433 |
| 4.593008459548131 | 0.653 | 0.521 | 0.435 |
| 4.596150052201721 | 0.656 | 0.523 | 0.437 |
| 4.59929164485531 | 0.658 | 0.526 | 0.439 |
| 4.6024332375089 | 0.661 | 0.528 | 0.442 |
| 4.60557483016249 | 0.664 | 0.531 | 0.444 |
| 4.608716422816079 | 0.666 | 0.533 | 0.446 |
| 4.611858015469668 | 0.669 | 0.535 | 0.448 |
| 4.614999608123258 | 0.671 | 0.538 | 0.451 |
| 4.618141200776848 | 0.674 | 0.54 | 0.453 |
| 4.621282793430437 | 0.677 | 0.543 | 0.455 |
| 4.624424386084027 | 0.679 | 0.545 | 0.457 |
| 4.627565978737617 | 0.682 | 0.548 | 0.46 |
| 4.630707571391206 | 0.685 | 0.55 | 0.462 |
| 4.633849164044795 | 0.687 | 0.553 | 0.464 |
| 4.636990756698386 | 0.69 | 0.555 | 0.467 |
| 4.640132349351975 | 0.693 | 0.558 | 0.469 |
| 4.643273942005564 | 0.696 | 0.56 | 0.472 |
| 4.646415534659154 | 0.698 | 0.563 | 0.474 |
| 4.649557127312744 | 0.701 | 0.566 | 0.477 |
| 4.652698719966334 | 0.704 | 0.568 | 0.479 |
| 4.655840312619923 | 0.707 | 0.571 | 0.482 |
| 4.658981905273513 | 0.71 | 0.574 | 0.484 |
| 4.662123497927102 | 0.712 | 0.576 | 0.487 |
| 4.665265090580692 | 0.715 | 0.579 | 0.49 |
| 4.668406683234282 | 0.718 | 0.582 | 0.492 |
| 4.671548275887871 | 0.721 | 0.585 | 0.495 |
| 4.674689868541461 | 0.724 | 0.588 | 0.498 |
| 4.67783146119505 | 0.727 | 0.59 | 0.5 |
| 4.68097305384864 | 0.73 | 0.593 | 0.503 |
| 4.68411464650223 | 0.733 | 0.596 | 0.506 |
| 4.687256239155819 | 0.736 | 0.599 | 0.509 |
| 4.690397831809409 | 0.739 | 0.602 | 0.512 |
| 4.693539424462998 | 0.742 | 0.605 | 0.515 |
| 4.696681017116588 | 0.745 | 0.608 | 0.518 |
| 4.699822609770177 | 0.748 | 0.611 | 0.521 |
| 4.702964202423767 | 0.751 | 0.614 | 0.524 |
| 4.706105795077356 | 0.754 | 0.617 | 0.527 |
| 4.709247387730946 | 0.757 | 0.62 | 0.53 |
| 4.712388980384535 | 0.76 | 0.623 | 0.533 |
| 4.715530573038126 | 0.763 | 0.626 | 0.536 |
| 4.718672165691715 | 0.767 | 0.63 | 0.539 |
| 4.721813758345305 | 0.77 | 0.633 | 0.542 |
| 4.724955350998894 | 0.773 | 0.636 | 0.546 |
| 4.728096943652484 | 0.776 | 0.639 | 0.549 |
| 4.731238536306074 | 0.78 | 0.643 | 0.552 |
| 4.734380128959663 | 0.783 | 0.646 | 0.556 |
| 4.737521721613253 | 0.786 | 0.649 | 0.559 |
| 4.740663314266842 | 0.789 | 0.653 | 0.563 |
| 4.743804906920432 | 0.793 | 0.656 | 0.566 |
| 4.74694649957402 | 0.796 | 0.66 | 0.57 |
| 4.750088092227611 | 0.8 | 0.663 | 0.574 |
| 4.7532296848812 | 0.803 | 0.667 | 0.577 |
| 4.75637127753479 | 0.806 | 0.67 | 0.581 |
| 4.75951287018838 | 0.81 | 0.674 | 0.585 |
| 4.76265446284197 | 0.813 | 0.678 | 0.589 |
| 4.765796055495559 | 0.817 | 0.681 | 0.593 |
| 4.768937648149149 | 0.82 | 0.685 | 0.597 |
| 4.772079240802738 | 0.824 | 0.689 | 0.601 |
| 4.775220833456327 | 0.827 | 0.693 | 0.605 |
| 4.778362426109917 | 0.831 | 0.697 | 0.609 |
| 4.781504018763507 | 0.835 | 0.701 | 0.614 |
| 4.784645611417097 | 0.838 | 0.705 | 0.618 |
| 4.787787204070686 | 0.842 | 0.709 | 0.623 |
| 4.790928796724275 | 0.846 | 0.713 | 0.627 |
| 4.794070389377865 | 0.85 | 0.717 | 0.632 |
| 4.797211982031455 | 0.853 | 0.721 | 0.636 |
| 4.800353574685045 | 0.857 | 0.725 | 0.641 |
| 4.803495167338634 | 0.861 | 0.73 | 0.646 |
| 4.806636759992224 | 0.865 | 0.734 | 0.651 |
| 4.809778352645814 | 0.869 | 0.738 | 0.656 |
| 4.812919945299403 | 0.873 | 0.743 | 0.661 |
| 4.816061537952993 | 0.877 | 0.747 | 0.667 |
| 4.819203130606582 | 0.88 | 0.752 | 0.672 |
| 4.822344723260172 | 0.885 | 0.757 | 0.678 |
| 4.825486315913761 | 0.889 | 0.761 | 0.683 |
| 4.828627908567351 | 0.893 | 0.766 | 0.689 |
| 4.83176950122094 | 0.897 | 0.771 | 0.695 |
| 4.83491109387453 | 0.901 | 0.776 | 0.701 |
| 4.83805268652812 | 0.905 | 0.781 | 0.707 |
| 4.841194279181709 | 0.909 | 0.786 | 0.714 |
| 4.844335871835299 | 0.913 | 0.791 | 0.72 |
| 4.847477464488889 | 0.918 | 0.796 | 0.727 |
| 4.850619057142478 | 0.922 | 0.802 | 0.734 |
| 4.853760649796068 | 0.926 | 0.807 | 0.741 |
| 4.856902242449657 | 0.931 | 0.813 | 0.748 |
| 4.860043835103247 | 0.935 | 0.818 | 0.756 |
| 4.863185427756837 | 0.94 | 0.824 | 0.763 |
| 4.866327020410426 | 0.944 | 0.83 | 0.771 |
| 4.869468613064015 | 0.949 | 0.835 | 0.78 |
| 4.872610205717605 | 0.953 | 0.841 | 0.788 |
| 4.875751798371195 | 0.958 | 0.847 | 0.797 |
| 4.878893391024784 | 0.963 | 0.854 | 0.806 |
| 4.882034983678374 | 0.967 | 0.86 | 0.816 |
| 4.885176576331964 | 0.972 | 0.866 | 0.826 |
| 4.888318168985553 | 0.977 | 0.873 | 0.836 |
| 4.891459761639143 | 0.982 | 0.88 | 0.847 |
| 4.894601354292733 | 0.987 | 0.886 | 0.858 |
| 4.897742946946322 | 0.992 | 0.893 | 0.869 |
| 4.900884539599912 | 0.997 | 0.901 | 0.882 |
| 4.904026132253501 | 1.002 | 0.908 | 0.895 |
| 4.907167724907091 | 1.007 | 0.915 | 0.908 |
| 4.91030931756068 | 1.012 | 0.923 | 0.922 |
| 4.91345091021427 | 1.017 | 0.93 | 0.938 |
| 4.91659250286786 | 1.022 | 0.938 | 0.954 |
| 4.91973409552145 | 1.028 | 0.947 | 0.971 |
| 4.922875688175039 | 1.033 | 0.955 | 0.989 |
| 4.926017280828628 | 1.039 | 0.963 | 1.009 |
| 4.929158873482218 | 1.044 | 0.972 | 1.031 |
| 4.932300466135808 | 1.05 | 0.981 | 1.054 |
| 4.935442058789397 | 1.055 | 0.99 | 1.08 |
| 4.938583651442987 | 1.061 | 1 | 1.109 |
| 4.941725244096576 | 1.067 | 1.01 | 1.142 |
| 4.944866836750166 | 1.072 | 1.02 | 1.179 |
| 4.948008429403755 | 1.078 | 1.03 | 1.222 |
| 4.951150022057345 | 1.084 | 1.041 | 1.275 |
| 4.954291614710935 | 1.09 | 1.052 | 1.341 |
| 4.957433207364524 | 1.096 | 1.063 | 1.43 |
| 4.960574800018114 | 1.102 | 1.075 | 1.566 |
| 4.963716392671704 | 1.109 | 1.087 | 3 |
| 4.966857985325293 | 1.115 | 1.099 | 1.804 |
| 4.969999577978883 | 1.121 | 1.112 | 1.542 |
| 4.973141170632472 | 1.128 | 1.126 | 1.415 |
| 4.976282763286062 | 1.134 | 1.14 | 1.33 |
| 4.979424355939651 | 1.141 | 1.155 | 1.266 |
| 4.982565948593241 | 1.148 | 1.17 | 1.215 |
| 4.985707541246831 | 1.154 | 1.186 | 1.172 |
| 4.98884913390042 | 1.161 | 1.203 | 1.135 |
| 4.99199072655401 | 1.168 | 1.221 | 1.103 |
| 4.9951323192076 | 1.175 | 1.24 | 1.074 |
| 4.99827391186119 | 1.182 | 1.26 | 1.049 |
| 5.00141550451478 | 1.19 | 1.281 | 1.025 |
| 5.004557097168369 | 1.197 | 1.303 | 1.004 |
| 5.007698689821958 | 1.204 | 1.327 | 0.984 |
| 5.010840282475548 | 1.212 | 1.353 | 0.965 |
| 5.013981875129137 | 1.22 | 1.38 | 0.948 |
| 5.017123467782727 | 1.228 | 1.411 | 0.932 |
| 5.020265060436317 | 1.235 | 1.444 | 0.917 |
| 5.023406653089906 | 1.243 | 1.48 | 0.902 |
| 5.026548245743496 | 1.252 | 1.521 | 0.889 |
| 5.029689838397085 | 1.26 | 1.567 | 0.876 |
| 5.032831431050674 | 1.268 | 1.619 | 0.863 |
| 5.035973023704264 | 1.277 | 1.682 | 0.851 |
| 5.039114616357854 | 1.286 | 1.757 | 0.84 |
| 5.042256209011444 | 1.294 | 1.854 | 0.829 |
| 5.045397801665033 | 1.303 | 1.988 | 0.819 |
| 5.048539394318622 | 1.313 | 2.205 | 0.809 |
| 5.051680986972213 | 1.322 | 2.881 | 0.799 |
| 5.054822579625802 | 1.331 | 2.329 | 0.79 |
| 5.057964172279392 | 1.341 | 2.048 | 0.781 |
| 5.061105764932981 | 1.351 | 1.894 | 0.772 |
| 5.064247357586571 | 1.361 | 1.787 | 0.764 |
| 5.067388950240161 | 1.371 | 1.704 | 0.756 |
| 5.07053054289375 | 1.381 | 1.638 | 0.748 |
| 5.07367213554734 | 1.392 | 1.581 | 0.74 |
| 5.07681372820093 | 1.403 | 1.533 | 0.732 |
| 5.079955320854519 | 1.414 | 1.49 | 0.725 |
| 5.083096913508108 | 1.425 | 1.452 | 0.718 |
| 5.086238506161698 | 1.437 | 1.417 | 0.711 |
| 5.089380098815288 | 1.449 | 1.386 | 0.704 |
| 5.092521691468877 | 1.461 | 1.357 | 0.698 |
| 5.095663284122466 | 1.473 | 1.33 | 0.691 |
| 5.098804876776057 | 1.486 | 1.305 | 0.685 |
| 5.101946469429646 | 1.498 | 1.282 | 0.679 |
| 5.105088062083236 | 1.512 | 1.26 | 0.673 |
| 5.108229654736825 | 1.525 | 1.24 | 0.667 |
| 5.111371247390415 | 1.539 | 1.22 | 0.662 |
| 5.114512840044005 | 1.553 | 1.202 | 0.656 |
| 5.117654432697594 | 1.568 | 1.184 | 0.65 |
| 5.120796025351184 | 1.583 | 1.167 | 0.645 |
| 5.123937618004773 | 1.599 | 1.151 | 0.64 |
| 5.127079210658363 | 1.615 | 1.136 | 0.635 |
| 5.130220803311953 | 1.631 | 1.121 | 0.629 |
| 5.133362395965542 | 1.648 | 1.107 | 0.624 |
| 5.136503988619131 | 1.665 | 1.093 | 0.62 |
| 5.13964558127272 | 1.683 | 1.08 | 0.615 |
| 5.142787173926311 | 1.702 | 1.067 | 0.61 |
| 5.1459287665799 | 1.721 | 1.055 | 0.605 |
| 5.14907035923349 | 1.741 | 1.043 | 0.601 |
| 5.15221195188708 | 1.762 | 1.032 | 0.596 |
| 5.15535354454067 | 1.784 | 1.021 | 0.592 |
| 5.158495137194259 | 1.806 | 1.01 | 0.587 |
| 5.161636729847848 | 1.83 | 0.999 | 0.583 |
| 5.164778322501438 | 1.854 | 0.989 | 0.579 |
| 5.167919915155028 | 1.88 | 0.979 | 0.575 |
| 5.171061507808617 | 1.906 | 0.969 | 0.571 |
| 5.174203100462206 | 1.935 | 0.96 | 0.567 |
| 5.177344693115796 | 1.964 | 0.951 | 0.563 |
| 5.180486285769386 | 1.995 | 0.942 | 0.559 |
| 5.183627878422976 | 2.029 | 0.933 | 0.555 |
| 5.186769471076565 | 2.064 | 0.924 | 0.551 |
| 5.189911063730155 | 2.101 | 0.916 | 0.547 |
| 5.193052656383744 | 2.142 | 0.908 | 0.544 |
| 5.196194249037334 | 2.185 | 0.9 | 0.54 |
| 5.199335841690924 | 2.232 | 0.892 | 0.536 |
| 5.202477434344513 | 2.283 | 0.884 | 0.533 |
| 5.205619026998103 | 2.34 | 0.877 | 0.529 |
| 5.208760619651692 | 2.402 | 0.869 | 0.526 |
| 5.211902212305282 | 2.472 | 0.862 | 0.522 |
| 5.215043804958871 | 2.553 | 0.855 | 0.519 |
| 5.218185397612461 | 2.646 | 0.848 | 0.515 |
| 5.221326990266051 | 2.757 | 0.841 | 0.512 |
| 5.22446858291964 | 2.896 | 0.834 | 0.509 |
| 5.22761017557323 | 3.08 | 0.828 | 0.505 |
| 5.23075176822682 | 3.35 | 0.821 | 0.502 |
| 5.23389336088041 | 3.879 | 0.815 | 0.499 |
| 5.237034953533999 | 4.279 | 0.808 | 0.496 |
| 5.240176546187588 | 3.478 | 0.802 | 0.493 |
| 5.243318138841178 | 3.154 | 0.796 | 0.49 |
| 5.246459731494767 | 2.948 | 0.79 | 0.487 |
| 5.249601324148357 | 2.796 | 0.784 | 0.484 |
| 5.252742916801947 | 2.675 | 0.778 | 0.481 |
| 5.255884509455536 | 2.575 | 0.773 | 0.478 |
| 5.259026102109125 | 2.49 | 0.767 | 0.475 |
| 5.262167694762715 | 2.416 | 0.761 | 0.472 |
| 5.265309287416305 | 2.35 | 0.756 | 0.469 |
| 5.268450880069895 | 2.291 | 0.75 | 0.466 |
| 5.271592472723484 | 2.237 | 0.745 | 0.463 |
| 5.274734065377074 | 2.187 | 0.74 | 0.461 |
| 5.277875658030664 | 2.142 | 0.735 | 0.458 |
| 5.281017250684253 | 2.1 | 0.73 | 0.455 |
| 5.284158843337843 | 2.06 | 0.724 | 0.452 |
| 5.287300435991432 | 2.023 | 0.719 | 0.45 |
| 5.290442028645022 | 1.988 | 0.714 | 0.447 |
| 5.293583621298612 | 1.955 | 0.71 | 0.444 |
| 5.296725213952201 | 1.924 | 0.705 | 0.442 |
| 5.299866806605791 | 1.894 | 0.7 | 0.439 |
| 5.30300839925938 | 1.866 | 0.695 | 0.437 |
| 5.30614999191297 | 1.839 | 0.691 | 0.434 |
| 5.30929158456656 | 1.813 | 0.686 | 0.432 |
| 5.312433177220149 | 1.788 | 0.681 | 0.429 |
| 5.315574769873739 | 1.765 | 0.677 | 0.427 |
| 5.318716362527328 | 1.742 | 0.673 | 0.424 |
| 5.321857955180918 | 1.72 | 0.668 | 0.422 |
| 5.324999547834508 | 1.698 | 0.664 | 0.419 |
| 5.328141140488097 | 1.678 | 0.659 | 0.417 |
| 5.331282733141686 | 1.658 | 0.655 | 0.414 |
| 5.334424325795276 | 1.639 | 0.651 | 0.412 |
| 5.337565918448866 | 1.62 | 0.647 | 0.41 |
| 5.340707511102456 | 1.602 | 0.643 | 0.407 |
| 5.343849103756045 | 1.584 | 0.639 | 0.405 |
| 5.346990696409634 | 1.567 | 0.635 | 0.403 |
| 5.350132289063224 | 1.55 | 0.63 | 0.4 |
| 5.353273881716814 | 1.534 | 0.627 | 0.398 |
| 5.356415474370403 | 1.518 | 0.623 | 0.396 |
| 5.359557067023993 | 1.503 | 0.619 | 0.394 |
| 5.362698659677583 | 1.488 | 0.615 | 0.392 |
| 5.365840252331172 | 1.473 | 0.611 | 0.389 |
| 5.368981844984762 | 1.458 | 0.607 | 0.387 |
| 5.372123437638351 | 1.444 | 0.603 | 0.385 |
| 5.375265030291941 | 1.431 | 0.6 | 0.383 |
| 5.378406622945531 | 1.417 | 0.596 | 0.381 |
| 5.38154821559912 | 1.404 | 0.592 | 0.379 |
| 5.38468980825271 | 1.391 | 0.589 | 0.376 |
| 5.387831400906299 | 1.378 | 0.585 | 0.374 |
| 5.39097299355989 | 1.366 | 0.582 | 0.372 |
| 5.394114586213479 | 1.354 | 0.578 | 0.37 |
| 5.397256178867068 | 1.342 | 0.574 | 0.368 |
| 5.400397771520657 | 1.33 | 0.571 | 0.366 |
| 5.403539364174247 | 1.319 | 0.568 | 0.364 |
| 5.406680956827837 | 1.307 | 0.564 | 0.362 |
| 5.409822549481426 | 1.296 | 0.561 | 0.36 |
| 5.412964142135016 | 1.285 | 0.557 | 0.358 |
| 5.416105734788605 | 1.274 | 0.554 | 0.356 |
| 5.419247327442195 | 1.264 | 0.551 | 0.354 |
| 5.422388920095785 | 1.253 | 0.547 | 0.352 |
| 5.425530512749375 | 1.243 | 0.544 | 0.35 |
| 5.428672105402964 | 1.233 | 0.541 | 0.348 |
| 5.431813698056554 | 1.223 | 0.538 | 0.346 |
| 5.434955290710143 | 1.213 | 0.534 | 0.344 |
| 5.438096883363733 | 1.203 | 0.531 | 0.342 |
| 5.441238476017322 | 1.194 | 0.528 | 0.341 |
| 5.444380068670912 | 1.185 | 0.525 | 0.339 |
| 5.447521661324502 | 1.175 | 0.522 | 0.337 |
| 5.450663253978091 | 1.166 | 0.519 | 0.335 |
| 5.453804846631681 | 1.157 | 0.516 | 0.333 |
| 5.456946439285271 | 1.148 | 0.513 | 0.331 |
| 5.46008803193886 | 1.139 | 0.51 | 0.329 |
| 5.46322962459245 | 1.131 | 0.507 | 0.328 |
| 5.466371217246039 | 1.122 | 0.504 | 0.326 |
| 5.46951280989963 | 1.114 | 0.501 | 0.324 |
| 5.472654402553218 | 1.105 | 0.498 | 0.322 |
| 5.475795995206808 | 1.097 | 0.495 | 0.32 |
| 5.478937587860398 | 1.089 | 0.492 | 0.319 |
| 5.482079180513987 | 1.081 | 0.489 | 0.317 |
| 5.485220773167577 | 1.073 | 0.486 | 0.315 |
| 5.488362365821166 | 1.065 | 0.483 | 0.313 |
| 5.491503958474756 | 1.057 | 0.48 | 0.312 |
| 5.494645551128346 | 1.05 | 0.477 | 0.31 |
| 5.497787143781935 | 1.042 | 0.475 | 0.308 |
| 5.500928736435525 | 1.034 | 0.472 | 0.306 |
| 5.504070329089115 | 1.027 | 0.469 | 0.305 |
| 5.507211921742704 | 1.02 | 0.466 | 0.303 |
| 5.510353514396294 | 1.012 | 0.464 | 0.301 |
| 5.513495107049883 | 1.005 | 0.461 | 0.3 |
| 5.516636699703473 | 0.998 | 0.458 | 0.298 |
| 5.519778292357062 | 0.991 | 0.455 | 0.296 |
| 5.522919885010652 | 0.984 | 0.453 | 0.295 |
| 5.526061477664242 | 0.977 | 0.45 | 0.293 |
| 5.529203070317831 | 0.97 | 0.447 | 0.291 |
| 5.532344662971421 | 0.963 | 0.445 | 0.29 |
| 5.535486255625011 | 0.956 | 0.442 | 0.288 |
| 5.5386278482786 | 0.95 | 0.44 | 0.287 |
| 5.54176944093219 | 0.943 | 0.437 | 0.285 |
| 5.544911033585779 | 0.936 | 0.434 | 0.283 |
| 5.54805262623937 | 0.93 | 0.432 | 0.282 |
| 5.551194218892959 | 0.923 | 0.429 | 0.28 |
| 5.554335811546548 | 0.917 | 0.427 | 0.278 |
| 5.557477404200137 | 0.911 | 0.424 | 0.277 |
| 5.560618996853727 | 0.904 | 0.422 | 0.275 |
| 5.563760589507317 | 0.898 | 0.419 | 0.274 |
| 5.566902182160906 | 0.892 | 0.417 | 0.272 |
| 5.570043774814496 | 0.886 | 0.414 | 0.271 |
| 5.573185367468086 | 0.88 | 0.412 | 0.269 |
| 5.576326960121675 | 0.873 | 0.409 | 0.268 |
| 5.579468552775264 | 0.867 | 0.407 | 0.266 |
| 5.582610145428854 | 0.862 | 0.404 | 0.265 |
| 5.585751738082444 | 0.856 | 0.402 | 0.263 |
| 5.588893330736034 | 0.85 | 0.399 | 0.261 |
| 5.592034923389623 | 0.844 | 0.397 | 0.26 |
| 5.595176516043213 | 0.838 | 0.395 | 0.258 |
| 5.598318108696803 | 0.832 | 0.392 | 0.257 |
| 5.601459701350392 | 0.827 | 0.39 | 0.255 |
| 5.604601294003982 | 0.821 | 0.388 | 0.254 |
| 5.607742886657571 | 0.815 | 0.385 | 0.252 |
| 5.610884479311161 | 0.81 | 0.383 | 0.251 |
| 5.61402607196475 | 0.804 | 0.381 | 0.25 |
| 5.61716766461834 | 0.799 | 0.378 | 0.248 |
| 5.62030925727193 | 0.793 | 0.376 | 0.247 |
| 5.623450849925519 | 0.788 | 0.374 | 0.245 |
| 5.626592442579109 | 0.782 | 0.371 | 0.244 |
| 5.629734035232698 | 0.777 | 0.369 | 0.242 |
| 5.632875627886288 | 0.772 | 0.367 | 0.241 |
| 5.636017220539878 | 0.766 | 0.365 | 0.239 |
| 5.639158813193467 | 0.761 | 0.362 | 0.238 |
| 5.642300405847057 | 0.756 | 0.36 | 0.237 |
| 5.645441998500646 | 0.751 | 0.358 | 0.235 |
| 5.648583591154236 | 0.746 | 0.356 | 0.234 |
| 5.651725183807825 | 0.741 | 0.353 | 0.232 |
| 5.654866776461415 | 0.735 | 0.351 | 0.231 |
| 5.658008369115005 | 0.73 | 0.349 | 0.229 |
| 5.661149961768594 | 0.725 | 0.347 | 0.228 |
| 5.664291554422184 | 0.72 | 0.345 | 0.227 |
| 5.667433147075774 | 0.715 | 0.342 | 0.225 |
| 5.670574739729363 | 0.71 | 0.34 | 0.224 |
| 5.673716332382953 | 0.705 | 0.338 | 0.223 |
| 5.676857925036542 | 0.701 | 0.336 | 0.221 |
| 5.679999517690132 | 0.696 | 0.334 | 0.22 |
| 5.683141110343721 | 0.691 | 0.332 | 0.218 |
| 5.686282702997311 | 0.686 | 0.33 | 0.217 |
| 5.689424295650901 | 0.681 | 0.327 | 0.216 |
| 5.69256588830449 | 0.676 | 0.325 | 0.214 |
| 5.69570748095808 | 0.672 | 0.323 | 0.213 |
| 5.69884907361167 | 0.667 | 0.321 | 0.212 |
| 5.701990666265259 | 0.662 | 0.319 | 0.21 |
| 5.705132258918849 | 0.658 | 0.317 | 0.209 |
| 5.708273851572438 | 0.653 | 0.315 | 0.208 |
| 5.711415444226028 | 0.648 | 0.313 | 0.206 |
| 5.714557036879618 | 0.644 | 0.311 | 0.205 |
| 5.717698629533207 | 0.639 | 0.309 | 0.204 |
| 5.720840222186797 | 0.635 | 0.307 | 0.202 |
| 5.723981814840386 | 0.63 | 0.305 | 0.201 |
| 5.727123407493976 | 0.626 | 0.303 | 0.2 |
| 5.730265000147565 | 0.621 | 0.301 | 0.198 |
| 5.733406592801155 | 0.617 | 0.299 | 0.197 |
| 5.736548185454744 | 0.612 | 0.297 | 0.196 |
| 5.739689778108334 | 0.608 | 0.295 | 0.194 |
| 5.742831370761924 | 0.603 | 0.293 | 0.193 |
| 5.745972963415514 | 0.599 | 0.291 | 0.192 |
| 5.749114556069103 | 0.595 | 0.289 | 0.191 |
| 5.752256148722693 | 0.59 | 0.287 | 0.189 |
| 5.755397741376282 | 0.586 | 0.285 | 0.188 |
| 5.758539334029872 | 0.582 | 0.283 | 0.187 |
| 5.761680926683462 | 0.577 | 0.281 | 0.185 |
| 5.764822519337051 | 0.573 | 0.279 | 0.184 |
| 5.767964111990641 | 0.569 | 0.277 | 0.183 |
| 5.77110570464423 | 0.565 | 0.275 | 0.182 |
| 5.77424729729782 | 0.56 | 0.273 | 0.18 |
| 5.77738888995141 | 0.556 | 0.271 | 0.179 |
| 5.780530482605 | 0.552 | 0.269 | 0.178 |
| 5.783672075258588 | 0.548 | 0.267 | 0.177 |
| 5.786813667912178 | 0.544 | 0.265 | 0.175 |
| 5.789955260565768 | 0.54 | 0.263 | 0.174 |
| 5.793096853219358 | 0.535 | 0.261 | 0.173 |
| 5.796238445872947 | 0.531 | 0.259 | 0.172 |
| 5.799380038526537 | 0.527 | 0.258 | 0.17 |
| 5.802521631180126 | 0.523 | 0.256 | 0.169 |
| 5.805663223833715 | 0.519 | 0.254 | 0.168 |
| 5.808804816487306 | 0.515 | 0.252 | 0.167 |
| 5.811946409140895 | 0.511 | 0.25 | 0.165 |
| 5.815088001794485 | 0.507 | 0.248 | 0.164 |
| 5.818229594448074 | 0.503 | 0.246 | 0.163 |
| 5.821371187101663 | 0.499 | 0.244 | 0.162 |
| 5.824512779755254 | 0.495 | 0.243 | 0.161 |
| 5.827654372408843 | 0.491 | 0.241 | 0.159 |
| 5.830795965062433 | 0.487 | 0.239 | 0.158 |
| 5.833937557716022 | 0.483 | 0.237 | 0.157 |
| 5.837079150369612 | 0.479 | 0.235 | 0.156 |
| 5.840220743023201 | 0.476 | 0.233 | 0.155 |
| 5.843362335676791 | 0.472 | 0.231 | 0.153 |
| 5.846503928330381 | 0.468 | 0.23 | 0.152 |
| 5.84964552098397 | 0.464 | 0.228 | 0.151 |
| 5.85278711363756 | 0.46 | 0.226 | 0.15 |
| 5.85592870629115 | 0.456 | 0.224 | 0.149 |
| 5.85907029894474 | 0.452 | 0.222 | 0.147 |
| 5.862211891598329 | 0.449 | 0.221 | 0.146 |
| 5.865353484251918 | 0.445 | 0.219 | 0.145 |
| 5.868495076905508 | 0.441 | 0.217 | 0.144 |
| 5.871636669559098 | 0.437 | 0.215 | 0.143 |
| 5.874778262212687 | 0.433 | 0.213 | 0.141 |
| 5.877919854866277 | 0.43 | 0.212 | 0.14 |
| 5.881061447519866 | 0.426 | 0.21 | 0.139 |
| 5.884203040173456 | 0.422 | 0.208 | 0.138 |
| 5.887344632827046 | 0.419 | 0.206 | 0.137 |
| 5.890486225480635 | 0.415 | 0.204 | 0.136 |
| 5.893627818134224 | 0.411 | 0.203 | 0.134 |
| 5.896769410787814 | 0.407 | 0.201 | 0.133 |
| 5.899911003441404 | 0.404 | 0.199 | 0.132 |
| 5.903052596094994 | 0.4 | 0.197 | 0.131 |
| 5.906194188748583 | 0.396 | 0.196 | 0.13 |
| 5.909335781402172 | 0.393 | 0.194 | 0.129 |
| 5.912477374055762 | 0.389 | 0.192 | 0.128 |
| 5.915618966709352 | 0.385 | 0.19 | 0.126 |
| 5.918760559362942 | 0.382 | 0.189 | 0.125 |
| 5.921902152016531 | 0.378 | 0.187 | 0.124 |
| 5.92504374467012 | 0.375 | 0.185 | 0.123 |
| 5.92818533732371 | 0.371 | 0.183 | 0.122 |
| 5.9313269299773 | 0.367 | 0.182 | 0.121 |
| 5.93446852263089 | 0.364 | 0.18 | 0.12 |
| 5.93761011528448 | 0.36 | 0.178 | 0.118 |
| 5.940751707938068 | 0.357 | 0.176 | 0.117 |
| 5.943893300591658 | 0.353 | 0.175 | 0.116 |
| 5.947034893245248 | 0.35 | 0.173 | 0.115 |
| 5.950176485898837 | 0.346 | 0.171 | 0.114 |
| 5.953318078552427 | 0.343 | 0.17 | 0.113 |
| 5.956459671206017 | 0.339 | 0.168 | 0.112 |
| 5.959601263859606 | 0.336 | 0.166 | 0.11 |
| 5.962742856513196 | 0.332 | 0.165 | 0.109 |
| 5.965884449166785 | 0.329 | 0.163 | 0.108 |
| 5.969026041820375 | 0.325 | 0.161 | 0.107 |
| 5.972167634473964 | 0.322 | 0.159 | 0.106 |
| 5.975309227127554 | 0.318 | 0.158 | 0.105 |
| 5.978450819781144 | 0.315 | 0.156 | 0.104 |
| 5.981592412434733 | 0.311 | 0.154 | 0.103 |
| 5.984734005088323 | 0.308 | 0.153 | 0.102 |
| 5.987875597741913 | 0.304 | 0.151 | 0.1 |
| 5.991017190395502 | 0.301 | 0.149 | 0.099 |
| 5.994158783049092 | 0.297 | 0.148 | 0.098 |
| 5.997300375702681 | 0.294 | 0.146 | 0.097 |
| 6.000441968356271 | 0.291 | 0.144 | 0.096 |
| 6.003583561009861 | 0.287 | 0.143 | 0.095 |
| 6.00672515366345 | 0.284 | 0.141 | 0.094 |
| 6.00986674631704 | 0.28 | 0.139 | 0.093 |
| 6.01300833897063 | 0.277 | 0.138 | 0.092 |
| 6.01614993162422 | 0.274 | 0.136 | 0.09 |
| 6.019291524277808 | 0.27 | 0.134 | 0.089 |
| 6.022433116931398 | 0.267 | 0.133 | 0.088 |
| 6.025574709584988 | 0.264 | 0.131 | 0.087 |
| 6.028716302238577 | 0.26 | 0.129 | 0.086 |
| 6.031857894892167 | 0.257 | 0.128 | 0.085 |
| 6.034999487545757 | 0.253 | 0.126 | 0.084 |
| 6.038141080199346 | 0.25 | 0.124 | 0.083 |
| 6.041282672852935 | 0.247 | 0.123 | 0.082 |
| 6.044424265506525 | 0.243 | 0.121 | 0.081 |
| 6.047565858160115 | 0.24 | 0.119 | 0.08 |
| 6.050707450813704 | 0.237 | 0.118 | 0.078 |
| 6.053849043467294 | 0.233 | 0.116 | 0.077 |
| 6.056990636120884 | 0.23 | 0.115 | 0.076 |
| 6.060132228774473 | 0.227 | 0.113 | 0.075 |
| 6.063273821428063 | 0.224 | 0.111 | 0.074 |
| 6.066415414081653 | 0.22 | 0.11 | 0.073 |
| 6.069557006735242 | 0.217 | 0.108 | 0.072 |
| 6.072698599388831 | 0.214 | 0.106 | 0.071 |
| 6.07584019204242 | 0.21 | 0.105 | 0.07 |
| 6.078981784696011 | 0.207 | 0.103 | 0.069 |
| 6.082123377349601 | 0.204 | 0.102 | 0.068 |
| 6.08526497000319 | 0.201 | 0.1 | 0.067 |
| 6.08840656265678 | 0.197 | 0.098 | 0.065 |
| 6.09154815531037 | 0.194 | 0.097 | 0.064 |
| 6.094689747963959 | 0.191 | 0.095 | 0.063 |
| 6.097831340617549 | 0.188 | 0.093 | 0.062 |
| 6.100972933271138 | 0.184 | 0.092 | 0.061 |
| 6.104114525924728 | 0.181 | 0.09 | 0.06 |
| 6.107256118578317 | 0.178 | 0.089 | 0.059 |
| 6.110397711231907 | 0.175 | 0.087 | 0.058 |
| 6.113539303885497 | 0.171 | 0.085 | 0.057 |
| 6.116680896539086 | 0.168 | 0.084 | 0.056 |
| 6.119822489192675 | 0.165 | 0.082 | 0.055 |
| 6.122964081846265 | 0.162 | 0.081 | 0.054 |
| 6.126105674499855 | 0.158 | 0.079 | 0.053 |
| 6.129247267153445 | 0.155 | 0.077 | 0.052 |
| 6.132388859807034 | 0.152 | 0.076 | 0.051 |
| 6.135530452460624 | 0.149 | 0.074 | 0.049 |
| 6.138672045114213 | 0.146 | 0.073 | 0.048 |
| 6.141813637767803 | 0.142 | 0.071 | 0.047 |
| 6.144955230421393 | 0.139 | 0.069 | 0.046 |
| 6.148096823074982 | 0.136 | 0.068 | 0.045 |
| 6.151238415728571 | 0.133 | 0.066 | 0.044 |
| 6.154380008382161 | 0.13 | 0.065 | 0.043 |
| 6.157521601035751 | 0.126 | 0.063 | 0.042 |
| 6.16066319368934 | 0.123 | 0.061 | 0.041 |
| 6.16380478634293 | 0.12 | 0.06 | 0.04 |
| 6.16694637899652 | 0.117 | 0.058 | 0.039 |
| 6.170087971650109 | 0.114 | 0.057 | 0.038 |
| 6.173229564303698 | 0.11 | 0.055 | 0.037 |
| 6.176371156957289 | 0.107 | 0.054 | 0.036 |
| 6.179512749610878 | 0.104 | 0.052 | 0.035 |
| 6.182654342264468 | 0.101 | 0.05 | 0.034 |
| 6.185795934918057 | 0.098 | 0.049 | 0.033 |
| 6.188937527571647 | 0.095 | 0.047 | 0.031 |
| 6.192079120225237 | 0.091 | 0.046 | 0.03 |
| 6.195220712878826 | 0.088 | 0.044 | 0.029 |
| 6.198362305532415 | 0.085 | 0.042 | 0.028 |
| 6.201503898186005 | 0.082 | 0.041 | 0.027 |
| 6.204645490839594 | 0.079 | 0.039 | 0.026 |
| 6.207787083493184 | 0.076 | 0.038 | 0.025 |
| 6.210928676146774 | 0.072 | 0.036 | 0.024 |
| 6.214070268800364 | 0.069 | 0.035 | 0.023 |
| 6.217211861453953 | 0.066 | 0.033 | 0.022 |
| 6.220353454107543 | 0.063 | 0.031 | 0.021 |
| 6.223495046761133 | 0.06 | 0.03 | 0.02 |
| 6.226636639414722 | 0.057 | 0.028 | 0.019 |
| 6.229778232068312 | 0.053 | 0.027 | 0.018 |
| 6.232919824721901 | 0.05 | 0.025 | 0.017 |
| 6.236061417375491 | 0.047 | 0.024 | 0.016 |
| 6.23920301002908 | 0.044 | 0.022 | 0.015 |
| 6.24234460268267 | 0.041 | 0.02 | 0.014 |
| 6.24548619533626 | 0.038 | 0.019 | 0.013 |
| 6.24862778798985 | 0.035 | 0.017 | 0.012 |
| 6.251769380643438 | 0.031 | 0.016 | 0.01 |
| 6.254910973297028 | 0.028 | 0.014 | 0.009 |
| 6.258052565950618 | 0.025 | 0.013 | 0.008 |
| 6.261194158604208 | 0.022 | 0.011 | 0.007 |
| 6.264335751257797 | 0.019 | 0.009 | 0.006 |
| 6.267477343911387 | 0.016 | 0.008 | 0.005 |
| 6.270618936564976 | 0.013 | 0.006 | 0.004 |
| 6.273760529218566 | 0.009 | 0.005 | 0.003 |
| 6.276902121872155 | 0.006 | 0.003 | 0.002 |
| 6.280043714525745 | 0.003 | 0.002 | 0.001 |
| 6.283185307179335 | 0 | 0 | 0 |